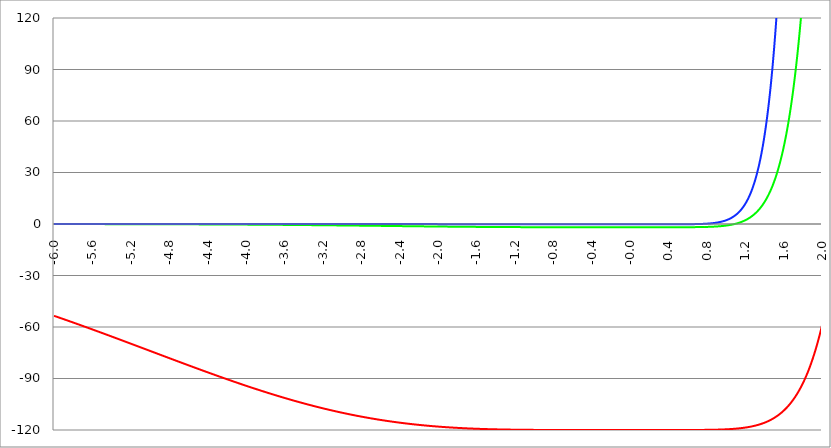
| Category | Series 1 | Series 0 | Series 2 |
|---|---|---|---|
| -6.0 | -53.482 | -0.038 | 0 |
| -5.996 | -53.559 | -0.038 | 0 |
| -5.992000000000001 | -53.636 | -0.039 | 0 |
| -5.988000000000001 | -53.713 | -0.039 | 0 |
| -5.984000000000002 | -53.79 | -0.039 | 0 |
| -5.980000000000002 | -53.868 | -0.039 | 0 |
| -5.976000000000002 | -53.945 | -0.039 | 0 |
| -5.972000000000003 | -54.023 | -0.039 | 0 |
| -5.968000000000003 | -54.1 | -0.04 | 0 |
| -5.964000000000004 | -54.178 | -0.04 | 0 |
| -5.960000000000004 | -54.255 | -0.04 | 0 |
| -5.956000000000004 | -54.333 | -0.04 | 0 |
| -5.952000000000005 | -54.41 | -0.04 | 0 |
| -5.948000000000005 | -54.488 | -0.041 | 0 |
| -5.944000000000006 | -54.566 | -0.041 | 0 |
| -5.940000000000006 | -54.644 | -0.041 | 0 |
| -5.936000000000007 | -54.722 | -0.041 | 0 |
| -5.932000000000007 | -54.8 | -0.042 | 0 |
| -5.928000000000008 | -54.878 | -0.042 | 0 |
| -5.924000000000008 | -54.956 | -0.042 | 0 |
| -5.920000000000009 | -55.034 | -0.042 | 0 |
| -5.91600000000001 | -55.112 | -0.042 | 0 |
| -5.91200000000001 | -55.19 | -0.043 | 0 |
| -5.90800000000001 | -55.268 | -0.043 | 0 |
| -5.904000000000011 | -55.346 | -0.043 | 0 |
| -5.900000000000011 | -55.425 | -0.043 | 0 |
| -5.896000000000011 | -55.503 | -0.043 | 0 |
| -5.892000000000012 | -55.582 | -0.044 | 0 |
| -5.888000000000012 | -55.66 | -0.044 | 0 |
| -5.884000000000013 | -55.738 | -0.044 | 0 |
| -5.880000000000013 | -55.817 | -0.044 | 0 |
| -5.876000000000014 | -55.896 | -0.045 | 0 |
| -5.872000000000014 | -55.974 | -0.045 | 0 |
| -5.868000000000014 | -56.053 | -0.045 | 0 |
| -5.864000000000015 | -56.132 | -0.045 | 0 |
| -5.860000000000015 | -56.21 | -0.045 | 0 |
| -5.856000000000016 | -56.289 | -0.046 | 0 |
| -5.852000000000016 | -56.368 | -0.046 | 0 |
| -5.848000000000017 | -56.447 | -0.046 | 0 |
| -5.844000000000017 | -56.526 | -0.046 | 0 |
| -5.840000000000018 | -56.605 | -0.047 | 0 |
| -5.836000000000018 | -56.684 | -0.047 | 0 |
| -5.832000000000018 | -56.763 | -0.047 | 0 |
| -5.828000000000019 | -56.842 | -0.047 | 0 |
| -5.824000000000019 | -56.922 | -0.047 | 0 |
| -5.82000000000002 | -57.001 | -0.048 | 0 |
| -5.81600000000002 | -57.08 | -0.048 | 0 |
| -5.812000000000021 | -57.16 | -0.048 | 0 |
| -5.808000000000021 | -57.239 | -0.048 | 0 |
| -5.804000000000022 | -57.318 | -0.049 | 0 |
| -5.800000000000022 | -57.398 | -0.049 | 0 |
| -5.796000000000022 | -57.477 | -0.049 | 0 |
| -5.792000000000023 | -57.557 | -0.049 | 0 |
| -5.788000000000023 | -57.636 | -0.05 | 0 |
| -5.784000000000024 | -57.716 | -0.05 | 0 |
| -5.780000000000024 | -57.796 | -0.05 | 0 |
| -5.776000000000024 | -57.875 | -0.05 | 0 |
| -5.772000000000025 | -57.955 | -0.051 | 0 |
| -5.768000000000025 | -58.035 | -0.051 | 0 |
| -5.764000000000026 | -58.115 | -0.051 | 0 |
| -5.760000000000026 | -58.195 | -0.051 | 0 |
| -5.756000000000026 | -58.275 | -0.052 | 0 |
| -5.752000000000027 | -58.355 | -0.052 | 0 |
| -5.748000000000027 | -58.435 | -0.052 | 0 |
| -5.744000000000028 | -58.515 | -0.052 | 0 |
| -5.740000000000028 | -58.595 | -0.053 | 0 |
| -5.73600000000003 | -58.675 | -0.053 | 0 |
| -5.73200000000003 | -58.755 | -0.053 | 0 |
| -5.72800000000003 | -58.835 | -0.053 | 0 |
| -5.72400000000003 | -58.916 | -0.054 | 0 |
| -5.720000000000031 | -58.996 | -0.054 | 0 |
| -5.716000000000031 | -59.076 | -0.054 | 0 |
| -5.712000000000032 | -59.157 | -0.054 | 0 |
| -5.708000000000032 | -59.237 | -0.055 | 0 |
| -5.704000000000033 | -59.318 | -0.055 | 0 |
| -5.700000000000033 | -59.398 | -0.055 | 0 |
| -5.696000000000033 | -59.479 | -0.056 | 0 |
| -5.692000000000034 | -59.559 | -0.056 | 0 |
| -5.688000000000034 | -59.64 | -0.056 | 0 |
| -5.684000000000035 | -59.721 | -0.056 | 0 |
| -5.680000000000035 | -59.801 | -0.057 | 0 |
| -5.676000000000035 | -59.882 | -0.057 | 0 |
| -5.672000000000036 | -59.963 | -0.057 | 0 |
| -5.668000000000036 | -60.044 | -0.057 | 0 |
| -5.664000000000037 | -60.125 | -0.058 | 0 |
| -5.660000000000037 | -60.205 | -0.058 | 0 |
| -5.656000000000038 | -60.286 | -0.058 | 0 |
| -5.652000000000038 | -60.367 | -0.059 | 0 |
| -5.648000000000039 | -60.448 | -0.059 | 0 |
| -5.644000000000039 | -60.529 | -0.059 | 0 |
| -5.64000000000004 | -60.61 | -0.059 | 0 |
| -5.63600000000004 | -60.692 | -0.06 | 0 |
| -5.63200000000004 | -60.773 | -0.06 | 0 |
| -5.628000000000041 | -60.854 | -0.06 | 0 |
| -5.624000000000041 | -60.935 | -0.061 | 0 |
| -5.620000000000042 | -61.016 | -0.061 | 0 |
| -5.616000000000042 | -61.098 | -0.061 | 0 |
| -5.612000000000043 | -61.179 | -0.061 | 0 |
| -5.608000000000043 | -61.26 | -0.062 | 0 |
| -5.604000000000044 | -61.342 | -0.062 | 0 |
| -5.600000000000044 | -61.423 | -0.062 | 0 |
| -5.596000000000044 | -61.505 | -0.063 | 0 |
| -5.592000000000045 | -61.586 | -0.063 | 0 |
| -5.588000000000045 | -61.668 | -0.063 | 0 |
| -5.584000000000046 | -61.749 | -0.064 | 0 |
| -5.580000000000046 | -61.831 | -0.064 | 0 |
| -5.576000000000046 | -61.913 | -0.064 | 0 |
| -5.572000000000047 | -61.994 | -0.065 | 0 |
| -5.568000000000048 | -62.076 | -0.065 | 0 |
| -5.564000000000048 | -62.158 | -0.065 | 0 |
| -5.560000000000048 | -62.24 | -0.065 | 0 |
| -5.556000000000049 | -62.321 | -0.066 | 0 |
| -5.552000000000049 | -62.403 | -0.066 | 0 |
| -5.54800000000005 | -62.485 | -0.066 | 0 |
| -5.54400000000005 | -62.567 | -0.067 | 0 |
| -5.540000000000051 | -62.649 | -0.067 | 0 |
| -5.536000000000051 | -62.731 | -0.067 | 0 |
| -5.532000000000052 | -62.813 | -0.068 | 0 |
| -5.528000000000052 | -62.895 | -0.068 | 0 |
| -5.524000000000052 | -62.977 | -0.068 | 0 |
| -5.520000000000053 | -63.059 | -0.069 | 0 |
| -5.516000000000053 | -63.141 | -0.069 | 0 |
| -5.512000000000054 | -63.224 | -0.069 | 0 |
| -5.508000000000054 | -63.306 | -0.07 | 0 |
| -5.504000000000055 | -63.388 | -0.07 | 0 |
| -5.500000000000055 | -63.47 | -0.07 | 0 |
| -5.496000000000055 | -63.553 | -0.071 | 0 |
| -5.492000000000056 | -63.635 | -0.071 | 0 |
| -5.488000000000056 | -63.717 | -0.071 | 0 |
| -5.484000000000057 | -63.8 | -0.072 | 0 |
| -5.480000000000057 | -63.882 | -0.072 | 0 |
| -5.476000000000057 | -63.964 | -0.072 | 0 |
| -5.472000000000058 | -64.047 | -0.073 | 0 |
| -5.468000000000059 | -64.129 | -0.073 | 0 |
| -5.464000000000059 | -64.212 | -0.073 | 0 |
| -5.460000000000059 | -64.294 | -0.074 | 0 |
| -5.45600000000006 | -64.377 | -0.074 | 0 |
| -5.45200000000006 | -64.46 | -0.074 | 0 |
| -5.44800000000006 | -64.542 | -0.075 | 0 |
| -5.444000000000061 | -64.625 | -0.075 | 0 |
| -5.440000000000061 | -64.708 | -0.076 | 0 |
| -5.436000000000062 | -64.79 | -0.076 | 0 |
| -5.432000000000062 | -64.873 | -0.076 | 0 |
| -5.428000000000063 | -64.956 | -0.077 | 0 |
| -5.424000000000063 | -65.039 | -0.077 | 0 |
| -5.420000000000064 | -65.121 | -0.077 | 0 |
| -5.416000000000064 | -65.204 | -0.078 | 0 |
| -5.412000000000064 | -65.287 | -0.078 | 0 |
| -5.408000000000065 | -65.37 | -0.078 | 0 |
| -5.404000000000065 | -65.453 | -0.079 | 0 |
| -5.400000000000066 | -65.536 | -0.079 | 0 |
| -5.396000000000066 | -65.619 | -0.08 | 0 |
| -5.392000000000067 | -65.702 | -0.08 | 0 |
| -5.388000000000067 | -65.785 | -0.08 | 0 |
| -5.384000000000068 | -65.868 | -0.081 | 0 |
| -5.380000000000068 | -65.951 | -0.081 | 0 |
| -5.376000000000068 | -66.034 | -0.082 | 0 |
| -5.37200000000007 | -66.117 | -0.082 | 0 |
| -5.36800000000007 | -66.2 | -0.082 | 0 |
| -5.36400000000007 | -66.283 | -0.083 | 0 |
| -5.36000000000007 | -66.367 | -0.083 | 0 |
| -5.356000000000071 | -66.45 | -0.083 | 0 |
| -5.352000000000071 | -66.533 | -0.084 | 0 |
| -5.348000000000072 | -66.616 | -0.084 | 0 |
| -5.344000000000072 | -66.7 | -0.085 | 0 |
| -5.340000000000073 | -66.783 | -0.085 | 0 |
| -5.336000000000073 | -66.866 | -0.085 | 0 |
| -5.332000000000074 | -66.949 | -0.086 | 0 |
| -5.328000000000074 | -67.033 | -0.086 | 0 |
| -5.324000000000074 | -67.116 | -0.087 | 0 |
| -5.320000000000075 | -67.2 | -0.087 | 0 |
| -5.316000000000075 | -67.283 | -0.087 | 0 |
| -5.312000000000076 | -67.366 | -0.088 | 0 |
| -5.308000000000076 | -67.45 | -0.088 | 0 |
| -5.304000000000077 | -67.533 | -0.089 | 0 |
| -5.300000000000077 | -67.617 | -0.089 | 0 |
| -5.296000000000077 | -67.7 | -0.09 | 0 |
| -5.292000000000078 | -67.784 | -0.09 | 0 |
| -5.288000000000078 | -67.867 | -0.09 | 0 |
| -5.284000000000079 | -67.951 | -0.091 | 0 |
| -5.28000000000008 | -68.035 | -0.091 | 0 |
| -5.27600000000008 | -68.118 | -0.092 | 0 |
| -5.27200000000008 | -68.202 | -0.092 | 0 |
| -5.268000000000081 | -68.285 | -0.093 | 0 |
| -5.264000000000081 | -68.369 | -0.093 | 0 |
| -5.260000000000081 | -68.453 | -0.093 | 0 |
| -5.256000000000082 | -68.536 | -0.094 | 0 |
| -5.252000000000082 | -68.62 | -0.094 | 0 |
| -5.248000000000083 | -68.704 | -0.095 | 0 |
| -5.244000000000083 | -68.788 | -0.095 | 0 |
| -5.240000000000084 | -68.871 | -0.096 | 0 |
| -5.236000000000084 | -68.955 | -0.096 | 0 |
| -5.232000000000084 | -69.039 | -0.096 | 0 |
| -5.228000000000085 | -69.123 | -0.097 | 0 |
| -5.224000000000085 | -69.206 | -0.097 | 0 |
| -5.220000000000086 | -69.29 | -0.098 | 0 |
| -5.216000000000086 | -69.374 | -0.098 | 0 |
| -5.212000000000087 | -69.458 | -0.099 | 0 |
| -5.208000000000087 | -69.542 | -0.099 | 0 |
| -5.204000000000088 | -69.626 | -0.1 | 0 |
| -5.200000000000088 | -69.71 | -0.1 | 0 |
| -5.196000000000089 | -69.793 | -0.101 | 0 |
| -5.192000000000089 | -69.877 | -0.101 | 0 |
| -5.188000000000089 | -69.961 | -0.101 | 0 |
| -5.18400000000009 | -70.045 | -0.102 | 0 |
| -5.18000000000009 | -70.129 | -0.102 | 0 |
| -5.176000000000091 | -70.213 | -0.103 | 0 |
| -5.172000000000091 | -70.297 | -0.103 | 0 |
| -5.168000000000092 | -70.381 | -0.104 | 0 |
| -5.164000000000092 | -70.465 | -0.104 | 0 |
| -5.160000000000092 | -70.549 | -0.105 | 0 |
| -5.156000000000093 | -70.633 | -0.105 | 0 |
| -5.152000000000093 | -70.717 | -0.106 | 0 |
| -5.148000000000094 | -70.801 | -0.106 | 0 |
| -5.144000000000094 | -70.885 | -0.107 | 0 |
| -5.140000000000095 | -70.969 | -0.107 | 0 |
| -5.136000000000095 | -71.053 | -0.108 | 0 |
| -5.132000000000096 | -71.137 | -0.108 | 0 |
| -5.128000000000096 | -71.222 | -0.109 | 0 |
| -5.124000000000096 | -71.306 | -0.109 | 0 |
| -5.120000000000097 | -71.39 | -0.11 | 0 |
| -5.116000000000097 | -71.474 | -0.11 | 0 |
| -5.112000000000098 | -71.558 | -0.111 | 0 |
| -5.108000000000098 | -71.642 | -0.111 | 0 |
| -5.104000000000099 | -71.726 | -0.112 | 0 |
| -5.100000000000099 | -71.81 | -0.112 | 0 |
| -5.0960000000001 | -71.895 | -0.113 | 0 |
| -5.0920000000001 | -71.979 | -0.113 | 0 |
| -5.0880000000001 | -72.063 | -0.114 | 0 |
| -5.084000000000101 | -72.147 | -0.114 | 0 |
| -5.080000000000101 | -72.231 | -0.115 | 0 |
| -5.076000000000101 | -72.315 | -0.115 | 0 |
| -5.072000000000102 | -72.4 | -0.116 | 0 |
| -5.068000000000103 | -72.484 | -0.116 | 0 |
| -5.064000000000103 | -72.568 | -0.117 | 0 |
| -5.060000000000104 | -72.652 | -0.118 | 0 |
| -5.056000000000104 | -72.736 | -0.118 | 0 |
| -5.052000000000104 | -72.82 | -0.119 | 0 |
| -5.048000000000104 | -72.905 | -0.119 | 0 |
| -5.044000000000105 | -72.989 | -0.12 | 0 |
| -5.040000000000105 | -73.073 | -0.12 | 0 |
| -5.036000000000106 | -73.157 | -0.121 | 0 |
| -5.032000000000106 | -73.242 | -0.121 | 0 |
| -5.028000000000107 | -73.326 | -0.122 | 0 |
| -5.024000000000107 | -73.41 | -0.122 | 0 |
| -5.020000000000108 | -73.494 | -0.123 | 0 |
| -5.016000000000108 | -73.578 | -0.124 | 0 |
| -5.012000000000109 | -73.663 | -0.124 | 0 |
| -5.00800000000011 | -73.747 | -0.125 | 0 |
| -5.00400000000011 | -73.831 | -0.125 | 0 |
| -5.00000000000011 | -73.915 | -0.126 | 0 |
| -4.99600000000011 | -74 | -0.126 | 0 |
| -4.992000000000111 | -74.084 | -0.127 | 0 |
| -4.988000000000111 | -74.168 | -0.127 | 0 |
| -4.984000000000112 | -74.252 | -0.128 | 0 |
| -4.980000000000112 | -74.336 | -0.129 | 0 |
| -4.976000000000112 | -74.421 | -0.129 | 0 |
| -4.972000000000113 | -74.505 | -0.13 | 0 |
| -4.968000000000114 | -74.589 | -0.13 | 0 |
| -4.964000000000114 | -74.673 | -0.131 | 0 |
| -4.960000000000114 | -74.757 | -0.132 | 0 |
| -4.956000000000114 | -74.842 | -0.132 | -0.001 |
| -4.952000000000115 | -74.926 | -0.133 | -0.001 |
| -4.948000000000115 | -75.01 | -0.133 | -0.001 |
| -4.944000000000116 | -75.094 | -0.134 | -0.001 |
| -4.940000000000116 | -75.178 | -0.135 | -0.001 |
| -4.936000000000117 | -75.263 | -0.135 | -0.001 |
| -4.932000000000117 | -75.347 | -0.136 | -0.001 |
| -4.928000000000118 | -75.431 | -0.136 | -0.001 |
| -4.924000000000118 | -75.515 | -0.137 | -0.001 |
| -4.920000000000119 | -75.599 | -0.138 | -0.001 |
| -4.91600000000012 | -75.684 | -0.138 | -0.001 |
| -4.91200000000012 | -75.768 | -0.139 | -0.001 |
| -4.90800000000012 | -75.852 | -0.139 | -0.001 |
| -4.90400000000012 | -75.936 | -0.14 | -0.001 |
| -4.90000000000012 | -76.02 | -0.141 | -0.001 |
| -4.896000000000121 | -76.104 | -0.141 | -0.001 |
| -4.892000000000122 | -76.188 | -0.142 | -0.001 |
| -4.888000000000122 | -76.273 | -0.143 | -0.001 |
| -4.884000000000123 | -76.357 | -0.143 | -0.001 |
| -4.880000000000123 | -76.441 | -0.144 | -0.001 |
| -4.876000000000123 | -76.525 | -0.145 | -0.001 |
| -4.872000000000124 | -76.609 | -0.145 | -0.001 |
| -4.868000000000124 | -76.693 | -0.146 | -0.001 |
| -4.864000000000125 | -76.777 | -0.146 | -0.001 |
| -4.860000000000125 | -76.861 | -0.147 | -0.001 |
| -4.856000000000125 | -76.945 | -0.148 | -0.001 |
| -4.852000000000126 | -77.029 | -0.148 | -0.001 |
| -4.848000000000126 | -77.113 | -0.149 | -0.001 |
| -4.844000000000127 | -77.197 | -0.15 | -0.001 |
| -4.840000000000127 | -77.281 | -0.15 | -0.001 |
| -4.836000000000128 | -77.365 | -0.151 | -0.001 |
| -4.832000000000128 | -77.449 | -0.152 | -0.001 |
| -4.82800000000013 | -77.533 | -0.152 | -0.001 |
| -4.824000000000129 | -77.617 | -0.153 | -0.001 |
| -4.82000000000013 | -77.701 | -0.154 | -0.001 |
| -4.81600000000013 | -77.785 | -0.154 | -0.001 |
| -4.812000000000131 | -77.869 | -0.155 | -0.001 |
| -4.808000000000131 | -77.953 | -0.156 | -0.001 |
| -4.804000000000132 | -78.037 | -0.156 | -0.001 |
| -4.800000000000132 | -78.121 | -0.157 | -0.001 |
| -4.796000000000132 | -78.205 | -0.158 | -0.001 |
| -4.792000000000133 | -78.289 | -0.159 | -0.001 |
| -4.788000000000133 | -78.372 | -0.159 | -0.001 |
| -4.784000000000134 | -78.456 | -0.16 | -0.001 |
| -4.780000000000134 | -78.54 | -0.161 | -0.001 |
| -4.776000000000134 | -78.624 | -0.161 | -0.001 |
| -4.772000000000135 | -78.708 | -0.162 | -0.001 |
| -4.768000000000135 | -78.791 | -0.163 | -0.001 |
| -4.764000000000136 | -78.875 | -0.163 | -0.001 |
| -4.760000000000136 | -78.959 | -0.164 | -0.001 |
| -4.756000000000136 | -79.043 | -0.165 | -0.001 |
| -4.752000000000137 | -79.126 | -0.166 | -0.001 |
| -4.748000000000137 | -79.21 | -0.166 | -0.001 |
| -4.744000000000138 | -79.294 | -0.167 | -0.001 |
| -4.740000000000138 | -79.377 | -0.168 | -0.001 |
| -4.73600000000014 | -79.461 | -0.169 | -0.001 |
| -4.73200000000014 | -79.544 | -0.169 | -0.001 |
| -4.72800000000014 | -79.628 | -0.17 | -0.001 |
| -4.72400000000014 | -79.712 | -0.171 | -0.001 |
| -4.720000000000141 | -79.795 | -0.171 | -0.001 |
| -4.716000000000141 | -79.879 | -0.172 | -0.001 |
| -4.712000000000142 | -79.962 | -0.173 | -0.001 |
| -4.708000000000142 | -80.046 | -0.174 | -0.001 |
| -4.704000000000143 | -80.129 | -0.175 | -0.001 |
| -4.700000000000143 | -80.213 | -0.175 | -0.001 |
| -4.696000000000143 | -80.296 | -0.176 | -0.001 |
| -4.692000000000144 | -80.379 | -0.177 | -0.001 |
| -4.688000000000144 | -80.463 | -0.178 | -0.001 |
| -4.684000000000145 | -80.546 | -0.178 | -0.001 |
| -4.680000000000145 | -80.63 | -0.179 | -0.001 |
| -4.676000000000145 | -80.713 | -0.18 | -0.001 |
| -4.672000000000146 | -80.796 | -0.181 | -0.001 |
| -4.668000000000147 | -80.879 | -0.181 | -0.001 |
| -4.664000000000147 | -80.963 | -0.182 | -0.001 |
| -4.660000000000147 | -81.046 | -0.183 | -0.001 |
| -4.656000000000148 | -81.129 | -0.184 | -0.001 |
| -4.652000000000148 | -81.212 | -0.185 | -0.001 |
| -4.648000000000149 | -81.295 | -0.185 | -0.001 |
| -4.644000000000149 | -81.379 | -0.186 | -0.001 |
| -4.64000000000015 | -81.462 | -0.187 | -0.001 |
| -4.63600000000015 | -81.545 | -0.188 | -0.001 |
| -4.632000000000151 | -81.628 | -0.189 | -0.001 |
| -4.628000000000151 | -81.711 | -0.189 | -0.001 |
| -4.624000000000151 | -81.794 | -0.19 | -0.001 |
| -4.620000000000152 | -81.877 | -0.191 | -0.001 |
| -4.616000000000152 | -81.96 | -0.192 | -0.001 |
| -4.612000000000153 | -82.043 | -0.193 | -0.001 |
| -4.608000000000153 | -82.125 | -0.193 | -0.001 |
| -4.604000000000154 | -82.208 | -0.194 | -0.001 |
| -4.600000000000154 | -82.291 | -0.195 | -0.001 |
| -4.596000000000154 | -82.374 | -0.196 | -0.001 |
| -4.592000000000155 | -82.457 | -0.197 | -0.001 |
| -4.588000000000155 | -82.539 | -0.198 | -0.001 |
| -4.584000000000156 | -82.622 | -0.198 | -0.001 |
| -4.580000000000156 | -82.705 | -0.199 | -0.001 |
| -4.576000000000156 | -82.787 | -0.2 | -0.001 |
| -4.572000000000157 | -82.87 | -0.201 | -0.001 |
| -4.568000000000158 | -82.953 | -0.202 | -0.001 |
| -4.564000000000158 | -83.035 | -0.203 | -0.001 |
| -4.560000000000159 | -83.118 | -0.204 | -0.001 |
| -4.55600000000016 | -83.2 | -0.204 | -0.001 |
| -4.552000000000159 | -83.283 | -0.205 | -0.001 |
| -4.54800000000016 | -83.365 | -0.206 | -0.001 |
| -4.54400000000016 | -83.448 | -0.207 | -0.001 |
| -4.54000000000016 | -83.53 | -0.208 | -0.001 |
| -4.53600000000016 | -83.612 | -0.209 | -0.001 |
| -4.532000000000161 | -83.695 | -0.21 | -0.001 |
| -4.528000000000162 | -83.777 | -0.211 | -0.001 |
| -4.524000000000163 | -83.859 | -0.212 | -0.001 |
| -4.520000000000163 | -83.941 | -0.212 | -0.001 |
| -4.516000000000163 | -84.023 | -0.213 | -0.001 |
| -4.512000000000164 | -84.105 | -0.214 | -0.001 |
| -4.508000000000164 | -84.188 | -0.215 | -0.001 |
| -4.504000000000164 | -84.27 | -0.216 | -0.001 |
| -4.500000000000165 | -84.352 | -0.217 | -0.001 |
| -4.496000000000165 | -84.434 | -0.218 | -0.001 |
| -4.492000000000166 | -84.516 | -0.219 | -0.001 |
| -4.488000000000166 | -84.597 | -0.22 | -0.001 |
| -4.484000000000166 | -84.679 | -0.221 | -0.001 |
| -4.480000000000167 | -84.761 | -0.222 | -0.001 |
| -4.476000000000167 | -84.843 | -0.222 | -0.001 |
| -4.472000000000168 | -84.925 | -0.223 | -0.001 |
| -4.468000000000168 | -85.006 | -0.224 | -0.001 |
| -4.46400000000017 | -85.088 | -0.225 | -0.001 |
| -4.46000000000017 | -85.17 | -0.226 | -0.001 |
| -4.45600000000017 | -85.251 | -0.227 | -0.001 |
| -4.45200000000017 | -85.333 | -0.228 | -0.001 |
| -4.44800000000017 | -85.414 | -0.229 | -0.001 |
| -4.444000000000171 | -85.496 | -0.23 | -0.001 |
| -4.440000000000171 | -85.577 | -0.231 | -0.001 |
| -4.436000000000172 | -85.659 | -0.232 | -0.001 |
| -4.432000000000172 | -85.74 | -0.233 | -0.001 |
| -4.428000000000173 | -85.821 | -0.234 | -0.001 |
| -4.424000000000174 | -85.903 | -0.235 | -0.001 |
| -4.420000000000174 | -85.984 | -0.236 | -0.001 |
| -4.416000000000174 | -86.065 | -0.237 | -0.002 |
| -4.412000000000174 | -86.146 | -0.238 | -0.002 |
| -4.408000000000175 | -86.227 | -0.239 | -0.002 |
| -4.404000000000175 | -86.308 | -0.24 | -0.002 |
| -4.400000000000176 | -86.389 | -0.241 | -0.002 |
| -4.396000000000176 | -86.47 | -0.242 | -0.002 |
| -4.392000000000177 | -86.551 | -0.243 | -0.002 |
| -4.388000000000177 | -86.632 | -0.244 | -0.002 |
| -4.384000000000178 | -86.713 | -0.245 | -0.002 |
| -4.380000000000178 | -86.794 | -0.246 | -0.002 |
| -4.376000000000178 | -86.875 | -0.247 | -0.002 |
| -4.37200000000018 | -86.955 | -0.248 | -0.002 |
| -4.36800000000018 | -87.036 | -0.249 | -0.002 |
| -4.36400000000018 | -87.116 | -0.25 | -0.002 |
| -4.360000000000181 | -87.197 | -0.251 | -0.002 |
| -4.356000000000181 | -87.278 | -0.252 | -0.002 |
| -4.352000000000181 | -87.358 | -0.253 | -0.002 |
| -4.348000000000182 | -87.438 | -0.254 | -0.002 |
| -4.344000000000182 | -87.519 | -0.255 | -0.002 |
| -4.340000000000183 | -87.599 | -0.256 | -0.002 |
| -4.336000000000183 | -87.679 | -0.257 | -0.002 |
| -4.332000000000184 | -87.76 | -0.258 | -0.002 |
| -4.328000000000184 | -87.84 | -0.259 | -0.002 |
| -4.324000000000185 | -87.92 | -0.26 | -0.002 |
| -4.320000000000185 | -88 | -0.261 | -0.002 |
| -4.316000000000185 | -88.08 | -0.262 | -0.002 |
| -4.312000000000186 | -88.16 | -0.263 | -0.002 |
| -4.308000000000186 | -88.24 | -0.265 | -0.002 |
| -4.304000000000187 | -88.32 | -0.266 | -0.002 |
| -4.300000000000187 | -88.4 | -0.267 | -0.002 |
| -4.296000000000187 | -88.479 | -0.268 | -0.002 |
| -4.292000000000188 | -88.559 | -0.269 | -0.002 |
| -4.288000000000188 | -88.639 | -0.27 | -0.002 |
| -4.284000000000189 | -88.718 | -0.271 | -0.002 |
| -4.28000000000019 | -88.798 | -0.272 | -0.002 |
| -4.27600000000019 | -88.877 | -0.273 | -0.002 |
| -4.27200000000019 | -88.957 | -0.274 | -0.002 |
| -4.268000000000191 | -89.036 | -0.275 | -0.002 |
| -4.264000000000191 | -89.115 | -0.277 | -0.002 |
| -4.260000000000192 | -89.195 | -0.278 | -0.002 |
| -4.256000000000192 | -89.274 | -0.279 | -0.002 |
| -4.252000000000192 | -89.353 | -0.28 | -0.002 |
| -4.248000000000193 | -89.432 | -0.281 | -0.002 |
| -4.244000000000193 | -89.511 | -0.282 | -0.002 |
| -4.240000000000194 | -89.59 | -0.283 | -0.002 |
| -4.236000000000194 | -89.669 | -0.284 | -0.002 |
| -4.232000000000194 | -89.748 | -0.286 | -0.002 |
| -4.228000000000195 | -89.827 | -0.287 | -0.002 |
| -4.224000000000196 | -89.906 | -0.288 | -0.002 |
| -4.220000000000196 | -89.984 | -0.289 | -0.002 |
| -4.216000000000196 | -90.063 | -0.29 | -0.002 |
| -4.212000000000197 | -90.142 | -0.291 | -0.002 |
| -4.208000000000197 | -90.22 | -0.293 | -0.002 |
| -4.204000000000198 | -90.299 | -0.294 | -0.002 |
| -4.200000000000198 | -90.377 | -0.295 | -0.002 |
| -4.196000000000199 | -90.456 | -0.296 | -0.002 |
| -4.192000000000199 | -90.534 | -0.297 | -0.002 |
| -4.1880000000002 | -90.612 | -0.298 | -0.002 |
| -4.1840000000002 | -90.69 | -0.3 | -0.002 |
| -4.1800000000002 | -90.768 | -0.301 | -0.002 |
| -4.176000000000201 | -90.846 | -0.302 | -0.002 |
| -4.172000000000201 | -90.924 | -0.303 | -0.002 |
| -4.168000000000202 | -91.002 | -0.304 | -0.002 |
| -4.164000000000202 | -91.08 | -0.306 | -0.002 |
| -4.160000000000203 | -91.158 | -0.307 | -0.002 |
| -4.156000000000203 | -91.236 | -0.308 | -0.002 |
| -4.152000000000204 | -91.313 | -0.309 | -0.003 |
| -4.148000000000204 | -91.391 | -0.311 | -0.003 |
| -4.144000000000204 | -91.469 | -0.312 | -0.003 |
| -4.140000000000205 | -91.546 | -0.313 | -0.003 |
| -4.136000000000205 | -91.624 | -0.314 | -0.003 |
| -4.132000000000206 | -91.701 | -0.315 | -0.003 |
| -4.128000000000206 | -91.778 | -0.317 | -0.003 |
| -4.124000000000207 | -91.855 | -0.318 | -0.003 |
| -4.120000000000207 | -91.933 | -0.319 | -0.003 |
| -4.116000000000207 | -92.01 | -0.32 | -0.003 |
| -4.112000000000208 | -92.087 | -0.322 | -0.003 |
| -4.108000000000208 | -92.164 | -0.323 | -0.003 |
| -4.104000000000209 | -92.241 | -0.324 | -0.003 |
| -4.100000000000209 | -92.317 | -0.325 | -0.003 |
| -4.09600000000021 | -92.394 | -0.327 | -0.003 |
| -4.09200000000021 | -92.471 | -0.328 | -0.003 |
| -4.088000000000211 | -92.548 | -0.329 | -0.003 |
| -4.084000000000211 | -92.624 | -0.331 | -0.003 |
| -4.080000000000211 | -92.701 | -0.332 | -0.003 |
| -4.076000000000212 | -92.777 | -0.333 | -0.003 |
| -4.072000000000212 | -92.853 | -0.334 | -0.003 |
| -4.068000000000213 | -92.93 | -0.336 | -0.003 |
| -4.064000000000213 | -93.006 | -0.337 | -0.003 |
| -4.060000000000214 | -93.082 | -0.338 | -0.003 |
| -4.056000000000214 | -93.158 | -0.34 | -0.003 |
| -4.052000000000215 | -93.234 | -0.341 | -0.003 |
| -4.048000000000215 | -93.31 | -0.342 | -0.003 |
| -4.044000000000215 | -93.386 | -0.344 | -0.003 |
| -4.040000000000216 | -93.462 | -0.345 | -0.003 |
| -4.036000000000216 | -93.537 | -0.346 | -0.003 |
| -4.032000000000217 | -93.613 | -0.348 | -0.003 |
| -4.028000000000217 | -93.689 | -0.349 | -0.003 |
| -4.024000000000218 | -93.764 | -0.35 | -0.003 |
| -4.020000000000218 | -93.84 | -0.352 | -0.003 |
| -4.016000000000219 | -93.915 | -0.353 | -0.003 |
| -4.012000000000219 | -93.99 | -0.354 | -0.003 |
| -4.008000000000219 | -94.065 | -0.356 | -0.003 |
| -4.00400000000022 | -94.141 | -0.357 | -0.003 |
| -4.00000000000022 | -94.216 | -0.359 | -0.003 |
| -3.99600000000022 | -94.291 | -0.36 | -0.003 |
| -3.99200000000022 | -94.366 | -0.361 | -0.003 |
| -3.98800000000022 | -94.44 | -0.363 | -0.003 |
| -3.98400000000022 | -94.515 | -0.364 | -0.003 |
| -3.98000000000022 | -94.59 | -0.365 | -0.003 |
| -3.97600000000022 | -94.664 | -0.367 | -0.004 |
| -3.97200000000022 | -94.739 | -0.368 | -0.004 |
| -3.96800000000022 | -94.813 | -0.37 | -0.004 |
| -3.96400000000022 | -94.888 | -0.371 | -0.004 |
| -3.96000000000022 | -94.962 | -0.373 | -0.004 |
| -3.95600000000022 | -95.036 | -0.374 | -0.004 |
| -3.95200000000022 | -95.11 | -0.375 | -0.004 |
| -3.94800000000022 | -95.184 | -0.377 | -0.004 |
| -3.94400000000022 | -95.258 | -0.378 | -0.004 |
| -3.94000000000022 | -95.332 | -0.38 | -0.004 |
| -3.93600000000022 | -95.406 | -0.381 | -0.004 |
| -3.93200000000022 | -95.48 | -0.383 | -0.004 |
| -3.92800000000022 | -95.554 | -0.384 | -0.004 |
| -3.92400000000022 | -95.627 | -0.385 | -0.004 |
| -3.92000000000022 | -95.701 | -0.387 | -0.004 |
| -3.91600000000022 | -95.774 | -0.388 | -0.004 |
| -3.91200000000022 | -95.847 | -0.39 | -0.004 |
| -3.90800000000022 | -95.921 | -0.391 | -0.004 |
| -3.90400000000022 | -95.994 | -0.393 | -0.004 |
| -3.90000000000022 | -96.067 | -0.394 | -0.004 |
| -3.89600000000022 | -96.14 | -0.396 | -0.004 |
| -3.89200000000022 | -96.213 | -0.397 | -0.004 |
| -3.88800000000022 | -96.286 | -0.399 | -0.004 |
| -3.88400000000022 | -96.358 | -0.4 | -0.004 |
| -3.88000000000022 | -96.431 | -0.402 | -0.004 |
| -3.87600000000022 | -96.504 | -0.403 | -0.004 |
| -3.87200000000022 | -96.576 | -0.405 | -0.004 |
| -3.86800000000022 | -96.649 | -0.406 | -0.004 |
| -3.86400000000022 | -96.721 | -0.408 | -0.004 |
| -3.86000000000022 | -96.793 | -0.409 | -0.004 |
| -3.85600000000022 | -96.865 | -0.411 | -0.004 |
| -3.85200000000022 | -96.938 | -0.412 | -0.004 |
| -3.84800000000022 | -97.01 | -0.414 | -0.004 |
| -3.84400000000022 | -97.081 | -0.415 | -0.004 |
| -3.84000000000022 | -97.153 | -0.417 | -0.005 |
| -3.83600000000022 | -97.225 | -0.418 | -0.005 |
| -3.83200000000022 | -97.297 | -0.42 | -0.005 |
| -3.82800000000022 | -97.368 | -0.422 | -0.005 |
| -3.82400000000022 | -97.44 | -0.423 | -0.005 |
| -3.82000000000022 | -97.511 | -0.425 | -0.005 |
| -3.81600000000022 | -97.582 | -0.426 | -0.005 |
| -3.81200000000022 | -97.654 | -0.428 | -0.005 |
| -3.80800000000022 | -97.725 | -0.429 | -0.005 |
| -3.80400000000022 | -97.796 | -0.431 | -0.005 |
| -3.80000000000022 | -97.867 | -0.433 | -0.005 |
| -3.79600000000022 | -97.938 | -0.434 | -0.005 |
| -3.79200000000022 | -98.008 | -0.436 | -0.005 |
| -3.78800000000022 | -98.079 | -0.437 | -0.005 |
| -3.78400000000022 | -98.15 | -0.439 | -0.005 |
| -3.78000000000022 | -98.22 | -0.441 | -0.005 |
| -3.77600000000022 | -98.291 | -0.442 | -0.005 |
| -3.77200000000022 | -98.361 | -0.444 | -0.005 |
| -3.76800000000022 | -98.431 | -0.445 | -0.005 |
| -3.76400000000022 | -98.501 | -0.447 | -0.005 |
| -3.76000000000022 | -98.571 | -0.449 | -0.005 |
| -3.75600000000022 | -98.641 | -0.45 | -0.005 |
| -3.75200000000022 | -98.711 | -0.452 | -0.005 |
| -3.74800000000022 | -98.781 | -0.454 | -0.005 |
| -3.74400000000022 | -98.85 | -0.455 | -0.005 |
| -3.74000000000022 | -98.92 | -0.457 | -0.005 |
| -3.73600000000022 | -98.99 | -0.458 | -0.005 |
| -3.73200000000022 | -99.059 | -0.46 | -0.005 |
| -3.72800000000022 | -99.128 | -0.462 | -0.006 |
| -3.72400000000022 | -99.197 | -0.463 | -0.006 |
| -3.72000000000022 | -99.267 | -0.465 | -0.006 |
| -3.71600000000022 | -99.336 | -0.467 | -0.006 |
| -3.71200000000022 | -99.404 | -0.468 | -0.006 |
| -3.70800000000022 | -99.473 | -0.47 | -0.006 |
| -3.70400000000022 | -99.542 | -0.472 | -0.006 |
| -3.70000000000022 | -99.611 | -0.474 | -0.006 |
| -3.69600000000022 | -99.679 | -0.475 | -0.006 |
| -3.69200000000022 | -99.748 | -0.477 | -0.006 |
| -3.68800000000022 | -99.816 | -0.479 | -0.006 |
| -3.68400000000022 | -99.884 | -0.48 | -0.006 |
| -3.68000000000022 | -99.952 | -0.482 | -0.006 |
| -3.67600000000022 | -100.02 | -0.484 | -0.006 |
| -3.67200000000022 | -100.088 | -0.486 | -0.006 |
| -3.66800000000022 | -100.156 | -0.487 | -0.006 |
| -3.66400000000022 | -100.224 | -0.489 | -0.006 |
| -3.66000000000022 | -100.292 | -0.491 | -0.006 |
| -3.65600000000022 | -100.359 | -0.492 | -0.006 |
| -3.65200000000022 | -100.427 | -0.494 | -0.006 |
| -3.64800000000022 | -100.494 | -0.496 | -0.006 |
| -3.64400000000022 | -100.561 | -0.498 | -0.006 |
| -3.64000000000022 | -100.628 | -0.499 | -0.006 |
| -3.63600000000022 | -100.695 | -0.501 | -0.007 |
| -3.63200000000022 | -100.762 | -0.503 | -0.007 |
| -3.62800000000022 | -100.829 | -0.505 | -0.007 |
| -3.62400000000022 | -100.896 | -0.507 | -0.007 |
| -3.62000000000022 | -100.963 | -0.508 | -0.007 |
| -3.61600000000022 | -101.029 | -0.51 | -0.007 |
| -3.61200000000022 | -101.096 | -0.512 | -0.007 |
| -3.60800000000022 | -101.162 | -0.514 | -0.007 |
| -3.60400000000022 | -101.228 | -0.516 | -0.007 |
| -3.60000000000022 | -101.294 | -0.517 | -0.007 |
| -3.59600000000022 | -101.36 | -0.519 | -0.007 |
| -3.59200000000022 | -101.426 | -0.521 | -0.007 |
| -3.58800000000022 | -101.492 | -0.523 | -0.007 |
| -3.58400000000022 | -101.558 | -0.525 | -0.007 |
| -3.58000000000022 | -101.623 | -0.526 | -0.007 |
| -3.57600000000022 | -101.689 | -0.528 | -0.007 |
| -3.57200000000022 | -101.754 | -0.53 | -0.007 |
| -3.56800000000022 | -101.82 | -0.532 | -0.007 |
| -3.56400000000022 | -101.885 | -0.534 | -0.007 |
| -3.56000000000022 | -101.95 | -0.536 | -0.007 |
| -3.55600000000022 | -102.015 | -0.537 | -0.008 |
| -3.55200000000022 | -102.08 | -0.539 | -0.008 |
| -3.54800000000022 | -102.145 | -0.541 | -0.008 |
| -3.54400000000022 | -102.209 | -0.543 | -0.008 |
| -3.54000000000022 | -102.274 | -0.545 | -0.008 |
| -3.53600000000022 | -102.338 | -0.547 | -0.008 |
| -3.53200000000022 | -102.403 | -0.549 | -0.008 |
| -3.52800000000022 | -102.467 | -0.551 | -0.008 |
| -3.52400000000022 | -102.531 | -0.552 | -0.008 |
| -3.52000000000022 | -102.595 | -0.554 | -0.008 |
| -3.51600000000022 | -102.659 | -0.556 | -0.008 |
| -3.51200000000022 | -102.723 | -0.558 | -0.008 |
| -3.50800000000022 | -102.787 | -0.56 | -0.008 |
| -3.50400000000022 | -102.85 | -0.562 | -0.008 |
| -3.50000000000022 | -102.914 | -0.564 | -0.008 |
| -3.49600000000022 | -102.977 | -0.566 | -0.008 |
| -3.49200000000022 | -103.04 | -0.568 | -0.008 |
| -3.48800000000022 | -103.103 | -0.57 | -0.008 |
| -3.48400000000022 | -103.167 | -0.572 | -0.009 |
| -3.48000000000022 | -103.229 | -0.573 | -0.009 |
| -3.47600000000022 | -103.292 | -0.575 | -0.009 |
| -3.47200000000022 | -103.355 | -0.577 | -0.009 |
| -3.46800000000022 | -103.418 | -0.579 | -0.009 |
| -3.46400000000022 | -103.48 | -0.581 | -0.009 |
| -3.46000000000022 | -103.543 | -0.583 | -0.009 |
| -3.45600000000022 | -103.605 | -0.585 | -0.009 |
| -3.45200000000022 | -103.667 | -0.587 | -0.009 |
| -3.44800000000022 | -103.729 | -0.589 | -0.009 |
| -3.44400000000022 | -103.791 | -0.591 | -0.009 |
| -3.44000000000022 | -103.853 | -0.593 | -0.009 |
| -3.43600000000022 | -103.915 | -0.595 | -0.009 |
| -3.43200000000022 | -103.976 | -0.597 | -0.009 |
| -3.42800000000022 | -104.038 | -0.599 | -0.009 |
| -3.42400000000022 | -104.099 | -0.601 | -0.009 |
| -3.42000000000022 | -104.16 | -0.603 | -0.01 |
| -3.41600000000022 | -104.222 | -0.605 | -0.01 |
| -3.41200000000022 | -104.283 | -0.607 | -0.01 |
| -3.40800000000022 | -104.344 | -0.609 | -0.01 |
| -3.40400000000022 | -104.404 | -0.611 | -0.01 |
| -3.40000000000022 | -104.465 | -0.613 | -0.01 |
| -3.39600000000022 | -104.526 | -0.615 | -0.01 |
| -3.39200000000022 | -104.586 | -0.617 | -0.01 |
| -3.38800000000022 | -104.647 | -0.619 | -0.01 |
| -3.38400000000022 | -104.707 | -0.621 | -0.01 |
| -3.38000000000022 | -104.767 | -0.623 | -0.01 |
| -3.37600000000022 | -104.827 | -0.625 | -0.01 |
| -3.37200000000022 | -104.887 | -0.627 | -0.01 |
| -3.36800000000022 | -104.947 | -0.629 | -0.01 |
| -3.36400000000022 | -105.006 | -0.631 | -0.01 |
| -3.36000000000022 | -105.066 | -0.634 | -0.011 |
| -3.35600000000022 | -105.125 | -0.636 | -0.011 |
| -3.35200000000022 | -105.185 | -0.638 | -0.011 |
| -3.34800000000022 | -105.244 | -0.64 | -0.011 |
| -3.34400000000022 | -105.303 | -0.642 | -0.011 |
| -3.34000000000022 | -105.362 | -0.644 | -0.011 |
| -3.33600000000022 | -105.421 | -0.646 | -0.011 |
| -3.33200000000022 | -105.48 | -0.648 | -0.011 |
| -3.32800000000022 | -105.538 | -0.65 | -0.011 |
| -3.32400000000022 | -105.597 | -0.652 | -0.011 |
| -3.32000000000022 | -105.655 | -0.654 | -0.011 |
| -3.31600000000022 | -105.713 | -0.657 | -0.011 |
| -3.31200000000022 | -105.771 | -0.659 | -0.011 |
| -3.30800000000022 | -105.83 | -0.661 | -0.012 |
| -3.30400000000022 | -105.887 | -0.663 | -0.012 |
| -3.30000000000022 | -105.945 | -0.665 | -0.012 |
| -3.29600000000022 | -106.003 | -0.667 | -0.012 |
| -3.29200000000022 | -106.06 | -0.669 | -0.012 |
| -3.28800000000022 | -106.118 | -0.671 | -0.012 |
| -3.28400000000022 | -106.175 | -0.674 | -0.012 |
| -3.28000000000022 | -106.232 | -0.676 | -0.012 |
| -3.27600000000022 | -106.289 | -0.678 | -0.012 |
| -3.27200000000022 | -106.346 | -0.68 | -0.012 |
| -3.26800000000022 | -106.403 | -0.682 | -0.012 |
| -3.26400000000022 | -106.46 | -0.684 | -0.012 |
| -3.26000000000022 | -106.517 | -0.687 | -0.012 |
| -3.25600000000022 | -106.573 | -0.689 | -0.013 |
| -3.25200000000022 | -106.629 | -0.691 | -0.013 |
| -3.24800000000022 | -106.686 | -0.693 | -0.013 |
| -3.24400000000022 | -106.742 | -0.695 | -0.013 |
| -3.24000000000022 | -106.798 | -0.697 | -0.013 |
| -3.23600000000022 | -106.854 | -0.7 | -0.013 |
| -3.23200000000022 | -106.909 | -0.702 | -0.013 |
| -3.22800000000022 | -106.965 | -0.704 | -0.013 |
| -3.22400000000022 | -107.021 | -0.706 | -0.013 |
| -3.22000000000022 | -107.076 | -0.708 | -0.013 |
| -3.21600000000022 | -107.131 | -0.711 | -0.013 |
| -3.21200000000022 | -107.186 | -0.713 | -0.014 |
| -3.20800000000022 | -107.241 | -0.715 | -0.014 |
| -3.20400000000022 | -107.296 | -0.717 | -0.014 |
| -3.20000000000022 | -107.351 | -0.72 | -0.014 |
| -3.19600000000022 | -107.406 | -0.722 | -0.014 |
| -3.19200000000022 | -107.46 | -0.724 | -0.014 |
| -3.18800000000022 | -107.515 | -0.726 | -0.014 |
| -3.18400000000022 | -107.569 | -0.728 | -0.014 |
| -3.18000000000022 | -107.623 | -0.731 | -0.014 |
| -3.17600000000022 | -107.677 | -0.733 | -0.014 |
| -3.17200000000022 | -107.731 | -0.735 | -0.014 |
| -3.16800000000022 | -107.785 | -0.737 | -0.015 |
| -3.16400000000022 | -107.838 | -0.74 | -0.015 |
| -3.16000000000022 | -107.892 | -0.742 | -0.015 |
| -3.15600000000022 | -107.945 | -0.744 | -0.015 |
| -3.152000000000219 | -107.999 | -0.747 | -0.015 |
| -3.148000000000219 | -108.052 | -0.749 | -0.015 |
| -3.144000000000219 | -108.105 | -0.751 | -0.015 |
| -3.140000000000219 | -108.158 | -0.753 | -0.015 |
| -3.136000000000219 | -108.211 | -0.756 | -0.015 |
| -3.132000000000219 | -108.263 | -0.758 | -0.015 |
| -3.128000000000219 | -108.316 | -0.76 | -0.016 |
| -3.124000000000219 | -108.368 | -0.763 | -0.016 |
| -3.120000000000219 | -108.42 | -0.765 | -0.016 |
| -3.116000000000219 | -108.473 | -0.767 | -0.016 |
| -3.112000000000219 | -108.525 | -0.77 | -0.016 |
| -3.108000000000219 | -108.577 | -0.772 | -0.016 |
| -3.104000000000219 | -108.628 | -0.774 | -0.016 |
| -3.100000000000219 | -108.68 | -0.776 | -0.016 |
| -3.096000000000219 | -108.731 | -0.779 | -0.016 |
| -3.092000000000219 | -108.783 | -0.781 | -0.016 |
| -3.088000000000219 | -108.834 | -0.783 | -0.017 |
| -3.084000000000219 | -108.885 | -0.786 | -0.017 |
| -3.080000000000219 | -108.936 | -0.788 | -0.017 |
| -3.076000000000219 | -108.987 | -0.79 | -0.017 |
| -3.072000000000219 | -109.038 | -0.793 | -0.017 |
| -3.068000000000219 | -109.089 | -0.795 | -0.017 |
| -3.064000000000219 | -109.139 | -0.798 | -0.017 |
| -3.060000000000219 | -109.189 | -0.8 | -0.017 |
| -3.056000000000219 | -109.24 | -0.802 | -0.017 |
| -3.052000000000219 | -109.29 | -0.805 | -0.018 |
| -3.048000000000219 | -109.34 | -0.807 | -0.018 |
| -3.044000000000219 | -109.39 | -0.809 | -0.018 |
| -3.040000000000219 | -109.439 | -0.812 | -0.018 |
| -3.036000000000219 | -109.489 | -0.814 | -0.018 |
| -3.032000000000219 | -109.539 | -0.816 | -0.018 |
| -3.028000000000219 | -109.588 | -0.819 | -0.018 |
| -3.024000000000219 | -109.637 | -0.821 | -0.018 |
| -3.020000000000219 | -109.686 | -0.824 | -0.018 |
| -3.016000000000219 | -109.735 | -0.826 | -0.019 |
| -3.012000000000219 | -109.784 | -0.828 | -0.019 |
| -3.008000000000219 | -109.833 | -0.831 | -0.019 |
| -3.004000000000219 | -109.881 | -0.833 | -0.019 |
| -3.000000000000219 | -109.93 | -0.836 | -0.019 |
| -2.996000000000219 | -109.978 | -0.838 | -0.019 |
| -2.992000000000219 | -110.026 | -0.84 | -0.019 |
| -2.988000000000219 | -110.074 | -0.843 | -0.019 |
| -2.984000000000219 | -110.122 | -0.845 | -0.02 |
| -2.980000000000219 | -110.17 | -0.848 | -0.02 |
| -2.976000000000219 | -110.218 | -0.85 | -0.02 |
| -2.972000000000219 | -110.265 | -0.853 | -0.02 |
| -2.968000000000219 | -110.313 | -0.855 | -0.02 |
| -2.964000000000219 | -110.36 | -0.857 | -0.02 |
| -2.960000000000219 | -110.407 | -0.86 | -0.02 |
| -2.956000000000219 | -110.454 | -0.862 | -0.02 |
| -2.952000000000219 | -110.501 | -0.865 | -0.021 |
| -2.948000000000219 | -110.548 | -0.867 | -0.021 |
| -2.944000000000219 | -110.595 | -0.87 | -0.021 |
| -2.940000000000219 | -110.641 | -0.872 | -0.021 |
| -2.936000000000219 | -110.688 | -0.875 | -0.021 |
| -2.932000000000219 | -110.734 | -0.877 | -0.021 |
| -2.928000000000219 | -110.78 | -0.88 | -0.021 |
| -2.924000000000219 | -110.826 | -0.882 | -0.021 |
| -2.920000000000219 | -110.872 | -0.884 | -0.022 |
| -2.916000000000219 | -110.918 | -0.887 | -0.022 |
| -2.912000000000219 | -110.963 | -0.889 | -0.022 |
| -2.908000000000219 | -111.009 | -0.892 | -0.022 |
| -2.904000000000219 | -111.054 | -0.894 | -0.022 |
| -2.900000000000219 | -111.099 | -0.897 | -0.022 |
| -2.896000000000219 | -111.144 | -0.899 | -0.022 |
| -2.892000000000219 | -111.189 | -0.902 | -0.023 |
| -2.888000000000219 | -111.234 | -0.904 | -0.023 |
| -2.884000000000219 | -111.279 | -0.907 | -0.023 |
| -2.880000000000219 | -111.323 | -0.909 | -0.023 |
| -2.876000000000219 | -111.368 | -0.912 | -0.023 |
| -2.872000000000219 | -111.412 | -0.914 | -0.023 |
| -2.868000000000219 | -111.456 | -0.917 | -0.023 |
| -2.864000000000219 | -111.5 | -0.919 | -0.024 |
| -2.860000000000219 | -111.544 | -0.922 | -0.024 |
| -2.856000000000219 | -111.588 | -0.924 | -0.024 |
| -2.852000000000219 | -111.631 | -0.927 | -0.024 |
| -2.848000000000219 | -111.675 | -0.929 | -0.024 |
| -2.844000000000219 | -111.718 | -0.932 | -0.024 |
| -2.840000000000219 | -111.762 | -0.934 | -0.024 |
| -2.836000000000219 | -111.805 | -0.937 | -0.025 |
| -2.832000000000219 | -111.848 | -0.939 | -0.025 |
| -2.828000000000219 | -111.891 | -0.942 | -0.025 |
| -2.824000000000219 | -111.933 | -0.945 | -0.025 |
| -2.820000000000219 | -111.976 | -0.947 | -0.025 |
| -2.816000000000219 | -112.018 | -0.95 | -0.025 |
| -2.812000000000219 | -112.061 | -0.952 | -0.025 |
| -2.808000000000219 | -112.103 | -0.955 | -0.026 |
| -2.804000000000219 | -112.145 | -0.957 | -0.026 |
| -2.800000000000219 | -112.187 | -0.96 | -0.026 |
| -2.796000000000219 | -112.229 | -0.962 | -0.026 |
| -2.792000000000219 | -112.27 | -0.965 | -0.026 |
| -2.78800000000022 | -112.312 | -0.967 | -0.026 |
| -2.78400000000022 | -112.353 | -0.97 | -0.027 |
| -2.78000000000022 | -112.394 | -0.972 | -0.027 |
| -2.776000000000219 | -112.436 | -0.975 | -0.027 |
| -2.772000000000219 | -112.477 | -0.978 | -0.027 |
| -2.76800000000022 | -112.517 | -0.98 | -0.027 |
| -2.76400000000022 | -112.558 | -0.983 | -0.027 |
| -2.76000000000022 | -112.599 | -0.985 | -0.027 |
| -2.756000000000219 | -112.639 | -0.988 | -0.028 |
| -2.752000000000219 | -112.68 | -0.99 | -0.028 |
| -2.74800000000022 | -112.72 | -0.993 | -0.028 |
| -2.74400000000022 | -112.76 | -0.996 | -0.028 |
| -2.74000000000022 | -112.8 | -0.998 | -0.028 |
| -2.736000000000219 | -112.84 | -1.001 | -0.028 |
| -2.732000000000219 | -112.879 | -1.003 | -0.029 |
| -2.72800000000022 | -112.919 | -1.006 | -0.029 |
| -2.72400000000022 | -112.958 | -1.008 | -0.029 |
| -2.72000000000022 | -112.998 | -1.011 | -0.029 |
| -2.716000000000219 | -113.037 | -1.014 | -0.029 |
| -2.712000000000219 | -113.076 | -1.016 | -0.029 |
| -2.70800000000022 | -113.115 | -1.019 | -0.03 |
| -2.70400000000022 | -113.154 | -1.021 | -0.03 |
| -2.70000000000022 | -113.192 | -1.024 | -0.03 |
| -2.696000000000219 | -113.231 | -1.027 | -0.03 |
| -2.692000000000219 | -113.269 | -1.029 | -0.03 |
| -2.688000000000219 | -113.307 | -1.032 | -0.031 |
| -2.684000000000219 | -113.345 | -1.034 | -0.031 |
| -2.680000000000219 | -113.383 | -1.037 | -0.031 |
| -2.676000000000219 | -113.421 | -1.04 | -0.031 |
| -2.672000000000219 | -113.459 | -1.042 | -0.031 |
| -2.668000000000219 | -113.497 | -1.045 | -0.031 |
| -2.664000000000219 | -113.534 | -1.047 | -0.032 |
| -2.660000000000219 | -113.571 | -1.05 | -0.032 |
| -2.656000000000219 | -113.609 | -1.053 | -0.032 |
| -2.652000000000219 | -113.646 | -1.055 | -0.032 |
| -2.648000000000219 | -113.683 | -1.058 | -0.032 |
| -2.644000000000219 | -113.719 | -1.06 | -0.033 |
| -2.640000000000219 | -113.756 | -1.063 | -0.033 |
| -2.636000000000219 | -113.793 | -1.066 | -0.033 |
| -2.632000000000219 | -113.829 | -1.068 | -0.033 |
| -2.628000000000219 | -113.865 | -1.071 | -0.033 |
| -2.624000000000219 | -113.901 | -1.073 | -0.033 |
| -2.620000000000219 | -113.937 | -1.076 | -0.034 |
| -2.616000000000219 | -113.973 | -1.079 | -0.034 |
| -2.612000000000219 | -114.009 | -1.081 | -0.034 |
| -2.608000000000219 | -114.045 | -1.084 | -0.034 |
| -2.604000000000219 | -114.08 | -1.087 | -0.034 |
| -2.600000000000219 | -114.116 | -1.089 | -0.035 |
| -2.596000000000219 | -114.151 | -1.092 | -0.035 |
| -2.592000000000219 | -114.186 | -1.094 | -0.035 |
| -2.588000000000219 | -114.221 | -1.097 | -0.035 |
| -2.584000000000219 | -114.256 | -1.1 | -0.035 |
| -2.580000000000219 | -114.29 | -1.102 | -0.036 |
| -2.576000000000219 | -114.325 | -1.105 | -0.036 |
| -2.572000000000219 | -114.359 | -1.108 | -0.036 |
| -2.568000000000219 | -114.394 | -1.11 | -0.036 |
| -2.564000000000219 | -114.428 | -1.113 | -0.036 |
| -2.560000000000219 | -114.462 | -1.115 | -0.037 |
| -2.556000000000219 | -114.496 | -1.118 | -0.037 |
| -2.552000000000219 | -114.53 | -1.121 | -0.037 |
| -2.548000000000219 | -114.563 | -1.123 | -0.037 |
| -2.544000000000219 | -114.597 | -1.126 | -0.037 |
| -2.540000000000219 | -114.63 | -1.129 | -0.038 |
| -2.536000000000219 | -114.664 | -1.131 | -0.038 |
| -2.532000000000219 | -114.697 | -1.134 | -0.038 |
| -2.528000000000219 | -114.73 | -1.137 | -0.038 |
| -2.524000000000219 | -114.763 | -1.139 | -0.038 |
| -2.520000000000219 | -114.796 | -1.142 | -0.039 |
| -2.516000000000219 | -114.828 | -1.144 | -0.039 |
| -2.512000000000219 | -114.861 | -1.147 | -0.039 |
| -2.508000000000219 | -114.893 | -1.15 | -0.039 |
| -2.504000000000219 | -114.925 | -1.152 | -0.04 |
| -2.500000000000219 | -114.957 | -1.155 | -0.04 |
| -2.496000000000219 | -114.989 | -1.158 | -0.04 |
| -2.492000000000219 | -115.021 | -1.16 | -0.04 |
| -2.488000000000219 | -115.053 | -1.163 | -0.04 |
| -2.484000000000219 | -115.085 | -1.165 | -0.041 |
| -2.480000000000219 | -115.116 | -1.168 | -0.041 |
| -2.476000000000219 | -115.148 | -1.171 | -0.041 |
| -2.472000000000219 | -115.179 | -1.173 | -0.041 |
| -2.468000000000219 | -115.21 | -1.176 | -0.041 |
| -2.464000000000219 | -115.241 | -1.179 | -0.042 |
| -2.460000000000219 | -115.272 | -1.181 | -0.042 |
| -2.456000000000219 | -115.302 | -1.184 | -0.042 |
| -2.452000000000219 | -115.333 | -1.187 | -0.042 |
| -2.448000000000219 | -115.364 | -1.189 | -0.043 |
| -2.444000000000219 | -115.394 | -1.192 | -0.043 |
| -2.440000000000219 | -115.424 | -1.194 | -0.043 |
| -2.436000000000219 | -115.454 | -1.197 | -0.043 |
| -2.432000000000219 | -115.484 | -1.2 | -0.044 |
| -2.428000000000219 | -115.514 | -1.202 | -0.044 |
| -2.424000000000219 | -115.544 | -1.205 | -0.044 |
| -2.420000000000219 | -115.573 | -1.208 | -0.044 |
| -2.416000000000219 | -115.603 | -1.21 | -0.044 |
| -2.412000000000219 | -115.632 | -1.213 | -0.045 |
| -2.408000000000219 | -115.661 | -1.215 | -0.045 |
| -2.404000000000219 | -115.69 | -1.218 | -0.045 |
| -2.400000000000219 | -115.719 | -1.221 | -0.045 |
| -2.396000000000219 | -115.748 | -1.223 | -0.046 |
| -2.392000000000219 | -115.777 | -1.226 | -0.046 |
| -2.388000000000219 | -115.805 | -1.228 | -0.046 |
| -2.384000000000219 | -115.834 | -1.231 | -0.046 |
| -2.380000000000219 | -115.862 | -1.234 | -0.047 |
| -2.376000000000219 | -115.89 | -1.236 | -0.047 |
| -2.372000000000219 | -115.918 | -1.239 | -0.047 |
| -2.368000000000219 | -115.946 | -1.242 | -0.047 |
| -2.364000000000219 | -115.974 | -1.244 | -0.048 |
| -2.360000000000219 | -116.002 | -1.247 | -0.048 |
| -2.356000000000219 | -116.03 | -1.249 | -0.048 |
| -2.352000000000219 | -116.057 | -1.252 | -0.048 |
| -2.348000000000219 | -116.084 | -1.255 | -0.049 |
| -2.344000000000219 | -116.112 | -1.257 | -0.049 |
| -2.340000000000219 | -116.139 | -1.26 | -0.049 |
| -2.336000000000219 | -116.166 | -1.262 | -0.049 |
| -2.332000000000219 | -116.193 | -1.265 | -0.05 |
| -2.328000000000219 | -116.219 | -1.268 | -0.05 |
| -2.324000000000219 | -116.246 | -1.27 | -0.05 |
| -2.320000000000219 | -116.272 | -1.273 | -0.05 |
| -2.316000000000219 | -116.299 | -1.275 | -0.051 |
| -2.312000000000219 | -116.325 | -1.278 | -0.051 |
| -2.308000000000219 | -116.351 | -1.281 | -0.051 |
| -2.304000000000219 | -116.377 | -1.283 | -0.051 |
| -2.300000000000219 | -116.403 | -1.286 | -0.052 |
| -2.296000000000219 | -116.429 | -1.288 | -0.052 |
| -2.292000000000219 | -116.454 | -1.291 | -0.052 |
| -2.288000000000219 | -116.48 | -1.294 | -0.052 |
| -2.284000000000219 | -116.505 | -1.296 | -0.053 |
| -2.280000000000219 | -116.53 | -1.299 | -0.053 |
| -2.276000000000219 | -116.556 | -1.301 | -0.053 |
| -2.272000000000219 | -116.581 | -1.304 | -0.053 |
| -2.268000000000219 | -116.606 | -1.306 | -0.054 |
| -2.264000000000219 | -116.63 | -1.309 | -0.054 |
| -2.260000000000219 | -116.655 | -1.312 | -0.054 |
| -2.256000000000219 | -116.68 | -1.314 | -0.055 |
| -2.252000000000219 | -116.704 | -1.317 | -0.055 |
| -2.248000000000219 | -116.728 | -1.319 | -0.055 |
| -2.244000000000219 | -116.752 | -1.322 | -0.055 |
| -2.240000000000219 | -116.777 | -1.324 | -0.056 |
| -2.236000000000219 | -116.801 | -1.327 | -0.056 |
| -2.232000000000219 | -116.824 | -1.33 | -0.056 |
| -2.228000000000219 | -116.848 | -1.332 | -0.056 |
| -2.224000000000219 | -116.872 | -1.335 | -0.057 |
| -2.220000000000219 | -116.895 | -1.337 | -0.057 |
| -2.216000000000219 | -116.919 | -1.34 | -0.057 |
| -2.212000000000219 | -116.942 | -1.342 | -0.058 |
| -2.208000000000219 | -116.965 | -1.345 | -0.058 |
| -2.204000000000219 | -116.988 | -1.347 | -0.058 |
| -2.200000000000219 | -117.011 | -1.35 | -0.058 |
| -2.196000000000219 | -117.034 | -1.352 | -0.059 |
| -2.192000000000219 | -117.056 | -1.355 | -0.059 |
| -2.188000000000219 | -117.079 | -1.357 | -0.059 |
| -2.184000000000219 | -117.101 | -1.36 | -0.06 |
| -2.180000000000219 | -117.124 | -1.362 | -0.06 |
| -2.176000000000219 | -117.146 | -1.365 | -0.06 |
| -2.172000000000219 | -117.168 | -1.367 | -0.06 |
| -2.168000000000219 | -117.19 | -1.37 | -0.061 |
| -2.164000000000219 | -117.212 | -1.372 | -0.061 |
| -2.160000000000219 | -117.233 | -1.375 | -0.061 |
| -2.156000000000219 | -117.255 | -1.377 | -0.062 |
| -2.152000000000219 | -117.277 | -1.38 | -0.062 |
| -2.148000000000219 | -117.298 | -1.382 | -0.062 |
| -2.144000000000219 | -117.319 | -1.385 | -0.062 |
| -2.140000000000219 | -117.34 | -1.387 | -0.063 |
| -2.136000000000219 | -117.362 | -1.39 | -0.063 |
| -2.132000000000219 | -117.383 | -1.392 | -0.063 |
| -2.128000000000219 | -117.403 | -1.395 | -0.064 |
| -2.124000000000219 | -117.424 | -1.397 | -0.064 |
| -2.120000000000219 | -117.445 | -1.4 | -0.064 |
| -2.116000000000219 | -117.465 | -1.402 | -0.064 |
| -2.112000000000219 | -117.486 | -1.405 | -0.065 |
| -2.108000000000219 | -117.506 | -1.407 | -0.065 |
| -2.104000000000219 | -117.526 | -1.41 | -0.065 |
| -2.100000000000219 | -117.546 | -1.412 | -0.066 |
| -2.096000000000219 | -117.566 | -1.415 | -0.066 |
| -2.092000000000219 | -117.586 | -1.417 | -0.066 |
| -2.088000000000219 | -117.606 | -1.419 | -0.067 |
| -2.084000000000219 | -117.625 | -1.422 | -0.067 |
| -2.080000000000219 | -117.645 | -1.424 | -0.067 |
| -2.076000000000219 | -117.664 | -1.427 | -0.067 |
| -2.072000000000219 | -117.683 | -1.429 | -0.068 |
| -2.068000000000219 | -117.703 | -1.432 | -0.068 |
| -2.064000000000219 | -117.722 | -1.434 | -0.068 |
| -2.060000000000219 | -117.741 | -1.436 | -0.069 |
| -2.056000000000219 | -117.76 | -1.439 | -0.069 |
| -2.052000000000219 | -117.778 | -1.441 | -0.069 |
| -2.048000000000219 | -117.797 | -1.444 | -0.07 |
| -2.044000000000219 | -117.815 | -1.446 | -0.07 |
| -2.040000000000219 | -117.834 | -1.448 | -0.07 |
| -2.036000000000219 | -117.852 | -1.451 | -0.071 |
| -2.032000000000219 | -117.87 | -1.453 | -0.071 |
| -2.028000000000219 | -117.889 | -1.456 | -0.071 |
| -2.024000000000219 | -117.907 | -1.458 | -0.071 |
| -2.020000000000219 | -117.924 | -1.46 | -0.072 |
| -2.016000000000219 | -117.942 | -1.463 | -0.072 |
| -2.012000000000219 | -117.96 | -1.465 | -0.072 |
| -2.008000000000218 | -117.978 | -1.467 | -0.073 |
| -2.004000000000218 | -117.995 | -1.47 | -0.073 |
| -2.000000000000218 | -118.012 | -1.472 | -0.073 |
| -1.996000000000218 | -118.03 | -1.474 | -0.074 |
| -1.992000000000218 | -118.047 | -1.477 | -0.074 |
| -1.988000000000218 | -118.064 | -1.479 | -0.074 |
| -1.984000000000218 | -118.081 | -1.481 | -0.075 |
| -1.980000000000218 | -118.098 | -1.484 | -0.075 |
| -1.976000000000218 | -118.114 | -1.486 | -0.075 |
| -1.972000000000218 | -118.131 | -1.488 | -0.076 |
| -1.968000000000218 | -118.148 | -1.491 | -0.076 |
| -1.964000000000218 | -118.164 | -1.493 | -0.076 |
| -1.960000000000218 | -118.18 | -1.495 | -0.077 |
| -1.956000000000218 | -118.197 | -1.498 | -0.077 |
| -1.952000000000218 | -118.213 | -1.5 | -0.077 |
| -1.948000000000218 | -118.229 | -1.502 | -0.078 |
| -1.944000000000218 | -118.245 | -1.504 | -0.078 |
| -1.940000000000218 | -118.261 | -1.507 | -0.078 |
| -1.936000000000218 | -118.276 | -1.509 | -0.079 |
| -1.932000000000218 | -118.292 | -1.511 | -0.079 |
| -1.928000000000218 | -118.308 | -1.514 | -0.079 |
| -1.924000000000218 | -118.323 | -1.516 | -0.079 |
| -1.920000000000218 | -118.338 | -1.518 | -0.08 |
| -1.916000000000218 | -118.354 | -1.52 | -0.08 |
| -1.912000000000218 | -118.369 | -1.522 | -0.08 |
| -1.908000000000218 | -118.384 | -1.525 | -0.081 |
| -1.904000000000218 | -118.399 | -1.527 | -0.081 |
| -1.900000000000218 | -118.414 | -1.529 | -0.081 |
| -1.896000000000218 | -118.428 | -1.531 | -0.082 |
| -1.892000000000218 | -118.443 | -1.534 | -0.082 |
| -1.888000000000218 | -118.458 | -1.536 | -0.082 |
| -1.884000000000218 | -118.472 | -1.538 | -0.083 |
| -1.880000000000218 | -118.487 | -1.54 | -0.083 |
| -1.876000000000218 | -118.501 | -1.542 | -0.083 |
| -1.872000000000218 | -118.515 | -1.545 | -0.084 |
| -1.868000000000218 | -118.529 | -1.547 | -0.084 |
| -1.864000000000218 | -118.543 | -1.549 | -0.084 |
| -1.860000000000218 | -118.557 | -1.551 | -0.085 |
| -1.856000000000218 | -118.571 | -1.553 | -0.085 |
| -1.852000000000218 | -118.585 | -1.555 | -0.085 |
| -1.848000000000218 | -118.598 | -1.557 | -0.086 |
| -1.844000000000218 | -118.612 | -1.56 | -0.086 |
| -1.840000000000218 | -118.625 | -1.562 | -0.087 |
| -1.836000000000218 | -118.639 | -1.564 | -0.087 |
| -1.832000000000218 | -118.652 | -1.566 | -0.087 |
| -1.828000000000218 | -118.665 | -1.568 | -0.088 |
| -1.824000000000218 | -118.678 | -1.57 | -0.088 |
| -1.820000000000218 | -118.691 | -1.572 | -0.088 |
| -1.816000000000218 | -118.704 | -1.574 | -0.089 |
| -1.812000000000218 | -118.717 | -1.576 | -0.089 |
| -1.808000000000218 | -118.729 | -1.579 | -0.089 |
| -1.804000000000218 | -118.742 | -1.581 | -0.09 |
| -1.800000000000218 | -118.755 | -1.583 | -0.09 |
| -1.796000000000218 | -118.767 | -1.585 | -0.09 |
| -1.792000000000218 | -118.779 | -1.587 | -0.091 |
| -1.788000000000218 | -118.792 | -1.589 | -0.091 |
| -1.784000000000218 | -118.804 | -1.591 | -0.091 |
| -1.780000000000218 | -118.816 | -1.593 | -0.092 |
| -1.776000000000218 | -118.828 | -1.595 | -0.092 |
| -1.772000000000218 | -118.84 | -1.597 | -0.092 |
| -1.768000000000218 | -118.852 | -1.599 | -0.093 |
| -1.764000000000218 | -118.864 | -1.601 | -0.093 |
| -1.760000000000218 | -118.875 | -1.603 | -0.093 |
| -1.756000000000218 | -118.887 | -1.605 | -0.094 |
| -1.752000000000218 | -118.898 | -1.607 | -0.094 |
| -1.748000000000218 | -118.91 | -1.609 | -0.094 |
| -1.744000000000218 | -118.921 | -1.611 | -0.095 |
| -1.740000000000218 | -118.932 | -1.613 | -0.095 |
| -1.736000000000218 | -118.943 | -1.615 | -0.095 |
| -1.732000000000218 | -118.954 | -1.617 | -0.096 |
| -1.728000000000218 | -118.965 | -1.619 | -0.096 |
| -1.724000000000218 | -118.976 | -1.621 | -0.096 |
| -1.720000000000218 | -118.987 | -1.623 | -0.097 |
| -1.716000000000218 | -118.998 | -1.625 | -0.097 |
| -1.712000000000218 | -119.009 | -1.627 | -0.097 |
| -1.708000000000218 | -119.019 | -1.628 | -0.098 |
| -1.704000000000218 | -119.03 | -1.63 | -0.098 |
| -1.700000000000218 | -119.04 | -1.632 | -0.099 |
| -1.696000000000218 | -119.05 | -1.634 | -0.099 |
| -1.692000000000218 | -119.061 | -1.636 | -0.099 |
| -1.688000000000218 | -119.071 | -1.638 | -0.1 |
| -1.684000000000218 | -119.081 | -1.64 | -0.1 |
| -1.680000000000218 | -119.091 | -1.642 | -0.1 |
| -1.676000000000218 | -119.101 | -1.644 | -0.101 |
| -1.672000000000218 | -119.111 | -1.645 | -0.101 |
| -1.668000000000218 | -119.121 | -1.647 | -0.101 |
| -1.664000000000218 | -119.13 | -1.649 | -0.102 |
| -1.660000000000218 | -119.14 | -1.651 | -0.102 |
| -1.656000000000218 | -119.149 | -1.653 | -0.102 |
| -1.652000000000218 | -119.159 | -1.654 | -0.103 |
| -1.648000000000218 | -119.168 | -1.656 | -0.103 |
| -1.644000000000218 | -119.178 | -1.658 | -0.103 |
| -1.640000000000218 | -119.187 | -1.66 | -0.104 |
| -1.636000000000218 | -119.196 | -1.662 | -0.104 |
| -1.632000000000218 | -119.205 | -1.663 | -0.104 |
| -1.628000000000218 | -119.214 | -1.665 | -0.105 |
| -1.624000000000218 | -119.223 | -1.667 | -0.105 |
| -1.620000000000218 | -119.232 | -1.669 | -0.105 |
| -1.616000000000218 | -119.241 | -1.67 | -0.106 |
| -1.612000000000218 | -119.249 | -1.672 | -0.106 |
| -1.608000000000218 | -119.258 | -1.674 | -0.106 |
| -1.604000000000218 | -119.267 | -1.676 | -0.107 |
| -1.600000000000218 | -119.275 | -1.677 | -0.107 |
| -1.596000000000218 | -119.284 | -1.679 | -0.108 |
| -1.592000000000218 | -119.292 | -1.681 | -0.108 |
| -1.588000000000218 | -119.3 | -1.682 | -0.108 |
| -1.584000000000218 | -119.308 | -1.684 | -0.109 |
| -1.580000000000218 | -119.317 | -1.686 | -0.109 |
| -1.576000000000218 | -119.325 | -1.687 | -0.109 |
| -1.572000000000218 | -119.333 | -1.689 | -0.11 |
| -1.568000000000218 | -119.341 | -1.691 | -0.11 |
| -1.564000000000218 | -119.349 | -1.692 | -0.11 |
| -1.560000000000218 | -119.356 | -1.694 | -0.111 |
| -1.556000000000218 | -119.364 | -1.696 | -0.111 |
| -1.552000000000218 | -119.372 | -1.697 | -0.111 |
| -1.548000000000218 | -119.379 | -1.699 | -0.112 |
| -1.544000000000218 | -119.387 | -1.701 | -0.112 |
| -1.540000000000218 | -119.394 | -1.702 | -0.112 |
| -1.536000000000218 | -119.402 | -1.704 | -0.113 |
| -1.532000000000218 | -119.409 | -1.705 | -0.113 |
| -1.528000000000218 | -119.416 | -1.707 | -0.113 |
| -1.524000000000218 | -119.423 | -1.708 | -0.114 |
| -1.520000000000218 | -119.431 | -1.71 | -0.114 |
| -1.516000000000218 | -119.438 | -1.712 | -0.114 |
| -1.512000000000218 | -119.445 | -1.713 | -0.115 |
| -1.508000000000218 | -119.452 | -1.715 | -0.115 |
| -1.504000000000218 | -119.458 | -1.716 | -0.115 |
| -1.500000000000218 | -119.465 | -1.718 | -0.116 |
| -1.496000000000218 | -119.472 | -1.719 | -0.116 |
| -1.492000000000218 | -119.479 | -1.721 | -0.116 |
| -1.488000000000218 | -119.485 | -1.722 | -0.117 |
| -1.484000000000218 | -119.492 | -1.724 | -0.117 |
| -1.480000000000218 | -119.498 | -1.725 | -0.117 |
| -1.476000000000218 | -119.505 | -1.727 | -0.118 |
| -1.472000000000218 | -119.511 | -1.728 | -0.118 |
| -1.468000000000218 | -119.518 | -1.729 | -0.118 |
| -1.464000000000218 | -119.524 | -1.731 | -0.119 |
| -1.460000000000218 | -119.53 | -1.732 | -0.119 |
| -1.456000000000218 | -119.536 | -1.734 | -0.119 |
| -1.452000000000218 | -119.542 | -1.735 | -0.12 |
| -1.448000000000218 | -119.548 | -1.737 | -0.12 |
| -1.444000000000218 | -119.554 | -1.738 | -0.12 |
| -1.440000000000218 | -119.56 | -1.739 | -0.121 |
| -1.436000000000218 | -119.566 | -1.741 | -0.121 |
| -1.432000000000218 | -119.572 | -1.742 | -0.121 |
| -1.428000000000218 | -119.577 | -1.744 | -0.122 |
| -1.424000000000218 | -119.583 | -1.745 | -0.122 |
| -1.420000000000218 | -119.589 | -1.746 | -0.122 |
| -1.416000000000218 | -119.594 | -1.748 | -0.123 |
| -1.412000000000218 | -119.6 | -1.749 | -0.123 |
| -1.408000000000218 | -119.605 | -1.75 | -0.123 |
| -1.404000000000218 | -119.611 | -1.752 | -0.124 |
| -1.400000000000218 | -119.616 | -1.753 | -0.124 |
| -1.396000000000218 | -119.621 | -1.754 | -0.124 |
| -1.392000000000218 | -119.626 | -1.756 | -0.125 |
| -1.388000000000218 | -119.632 | -1.757 | -0.125 |
| -1.384000000000218 | -119.637 | -1.758 | -0.125 |
| -1.380000000000218 | -119.642 | -1.759 | -0.126 |
| -1.376000000000218 | -119.647 | -1.761 | -0.126 |
| -1.372000000000218 | -119.652 | -1.762 | -0.126 |
| -1.368000000000218 | -119.657 | -1.763 | -0.127 |
| -1.364000000000218 | -119.661 | -1.764 | -0.127 |
| -1.360000000000218 | -119.666 | -1.766 | -0.127 |
| -1.356000000000218 | -119.671 | -1.767 | -0.127 |
| -1.352000000000218 | -119.676 | -1.768 | -0.128 |
| -1.348000000000218 | -119.68 | -1.769 | -0.128 |
| -1.344000000000218 | -119.685 | -1.77 | -0.128 |
| -1.340000000000218 | -119.689 | -1.772 | -0.129 |
| -1.336000000000218 | -119.694 | -1.773 | -0.129 |
| -1.332000000000218 | -119.698 | -1.774 | -0.129 |
| -1.328000000000218 | -119.703 | -1.775 | -0.13 |
| -1.324000000000218 | -119.707 | -1.776 | -0.13 |
| -1.320000000000218 | -119.712 | -1.777 | -0.13 |
| -1.316000000000218 | -119.716 | -1.779 | -0.131 |
| -1.312000000000218 | -119.72 | -1.78 | -0.131 |
| -1.308000000000218 | -119.724 | -1.781 | -0.131 |
| -1.304000000000218 | -119.728 | -1.782 | -0.131 |
| -1.300000000000218 | -119.732 | -1.783 | -0.132 |
| -1.296000000000218 | -119.736 | -1.784 | -0.132 |
| -1.292000000000218 | -119.74 | -1.785 | -0.132 |
| -1.288000000000218 | -119.744 | -1.786 | -0.133 |
| -1.284000000000218 | -119.748 | -1.787 | -0.133 |
| -1.280000000000218 | -119.752 | -1.788 | -0.133 |
| -1.276000000000218 | -119.756 | -1.79 | -0.134 |
| -1.272000000000218 | -119.76 | -1.791 | -0.134 |
| -1.268000000000218 | -119.763 | -1.792 | -0.134 |
| -1.264000000000218 | -119.767 | -1.793 | -0.134 |
| -1.260000000000218 | -119.771 | -1.794 | -0.135 |
| -1.256000000000218 | -119.774 | -1.795 | -0.135 |
| -1.252000000000218 | -119.778 | -1.796 | -0.135 |
| -1.248000000000218 | -119.781 | -1.797 | -0.136 |
| -1.244000000000218 | -119.785 | -1.798 | -0.136 |
| -1.240000000000218 | -119.788 | -1.799 | -0.136 |
| -1.236000000000218 | -119.791 | -1.8 | -0.136 |
| -1.232000000000218 | -119.795 | -1.801 | -0.137 |
| -1.228000000000218 | -119.798 | -1.802 | -0.137 |
| -1.224000000000218 | -119.801 | -1.803 | -0.137 |
| -1.220000000000218 | -119.805 | -1.804 | -0.138 |
| -1.216000000000218 | -119.808 | -1.804 | -0.138 |
| -1.212000000000218 | -119.811 | -1.805 | -0.138 |
| -1.208000000000218 | -119.814 | -1.806 | -0.138 |
| -1.204000000000218 | -119.817 | -1.807 | -0.139 |
| -1.200000000000218 | -119.82 | -1.808 | -0.139 |
| -1.196000000000218 | -119.823 | -1.809 | -0.139 |
| -1.192000000000218 | -119.826 | -1.81 | -0.139 |
| -1.188000000000218 | -119.829 | -1.811 | -0.14 |
| -1.184000000000218 | -119.832 | -1.812 | -0.14 |
| -1.180000000000218 | -119.834 | -1.813 | -0.14 |
| -1.176000000000218 | -119.837 | -1.813 | -0.141 |
| -1.172000000000218 | -119.84 | -1.814 | -0.141 |
| -1.168000000000218 | -119.843 | -1.815 | -0.141 |
| -1.164000000000218 | -119.845 | -1.816 | -0.141 |
| -1.160000000000218 | -119.848 | -1.817 | -0.142 |
| -1.156000000000218 | -119.851 | -1.818 | -0.142 |
| -1.152000000000218 | -119.853 | -1.818 | -0.142 |
| -1.148000000000218 | -119.856 | -1.819 | -0.142 |
| -1.144000000000218 | -119.858 | -1.82 | -0.143 |
| -1.140000000000218 | -119.861 | -1.821 | -0.143 |
| -1.136000000000218 | -119.863 | -1.822 | -0.143 |
| -1.132000000000218 | -119.866 | -1.822 | -0.143 |
| -1.128000000000218 | -119.868 | -1.823 | -0.144 |
| -1.124000000000218 | -119.87 | -1.824 | -0.144 |
| -1.120000000000218 | -119.873 | -1.825 | -0.144 |
| -1.116000000000218 | -119.875 | -1.825 | -0.144 |
| -1.112000000000218 | -119.877 | -1.826 | -0.145 |
| -1.108000000000218 | -119.88 | -1.827 | -0.145 |
| -1.104000000000218 | -119.882 | -1.828 | -0.145 |
| -1.100000000000218 | -119.884 | -1.828 | -0.145 |
| -1.096000000000218 | -119.886 | -1.829 | -0.146 |
| -1.092000000000218 | -119.888 | -1.83 | -0.146 |
| -1.088000000000218 | -119.89 | -1.83 | -0.146 |
| -1.084000000000218 | -119.892 | -1.831 | -0.146 |
| -1.080000000000218 | -119.894 | -1.832 | -0.146 |
| -1.076000000000218 | -119.896 | -1.832 | -0.147 |
| -1.072000000000218 | -119.898 | -1.833 | -0.147 |
| -1.068000000000218 | -119.9 | -1.834 | -0.147 |
| -1.064000000000218 | -119.902 | -1.834 | -0.147 |
| -1.060000000000218 | -119.904 | -1.835 | -0.148 |
| -1.056000000000218 | -119.906 | -1.836 | -0.148 |
| -1.052000000000218 | -119.907 | -1.836 | -0.148 |
| -1.048000000000218 | -119.909 | -1.837 | -0.148 |
| -1.044000000000218 | -119.911 | -1.838 | -0.149 |
| -1.040000000000218 | -119.913 | -1.838 | -0.149 |
| -1.036000000000218 | -119.914 | -1.839 | -0.149 |
| -1.032000000000218 | -119.916 | -1.839 | -0.149 |
| -1.028000000000218 | -119.918 | -1.84 | -0.149 |
| -1.024000000000218 | -119.919 | -1.841 | -0.15 |
| -1.020000000000218 | -119.921 | -1.841 | -0.15 |
| -1.016000000000218 | -119.923 | -1.842 | -0.15 |
| -1.012000000000218 | -119.924 | -1.842 | -0.15 |
| -1.008000000000218 | -119.926 | -1.843 | -0.15 |
| -1.004000000000218 | -119.927 | -1.843 | -0.151 |
| -1.000000000000218 | -119.929 | -1.844 | -0.151 |
| -0.996000000000218 | -119.93 | -1.844 | -0.151 |
| -0.992000000000218 | -119.932 | -1.845 | -0.151 |
| -0.988000000000218 | -119.933 | -1.846 | -0.151 |
| -0.984000000000218 | -119.934 | -1.846 | -0.152 |
| -0.980000000000218 | -119.936 | -1.847 | -0.152 |
| -0.976000000000218 | -119.937 | -1.847 | -0.152 |
| -0.972000000000218 | -119.938 | -1.848 | -0.152 |
| -0.968000000000218 | -119.94 | -1.848 | -0.152 |
| -0.964000000000218 | -119.941 | -1.849 | -0.153 |
| -0.960000000000218 | -119.942 | -1.849 | -0.153 |
| -0.956000000000218 | -119.944 | -1.85 | -0.153 |
| -0.952000000000218 | -119.945 | -1.85 | -0.153 |
| -0.948000000000218 | -119.946 | -1.85 | -0.153 |
| -0.944000000000218 | -119.947 | -1.851 | -0.153 |
| -0.940000000000218 | -119.948 | -1.851 | -0.154 |
| -0.936000000000218 | -119.949 | -1.852 | -0.154 |
| -0.932000000000218 | -119.951 | -1.852 | -0.154 |
| -0.928000000000218 | -119.952 | -1.853 | -0.154 |
| -0.924000000000218 | -119.953 | -1.853 | -0.154 |
| -0.920000000000218 | -119.954 | -1.854 | -0.154 |
| -0.916000000000218 | -119.955 | -1.854 | -0.155 |
| -0.912000000000218 | -119.956 | -1.854 | -0.155 |
| -0.908000000000217 | -119.957 | -1.855 | -0.155 |
| -0.904000000000217 | -119.958 | -1.855 | -0.155 |
| -0.900000000000217 | -119.959 | -1.856 | -0.155 |
| -0.896000000000217 | -119.96 | -1.856 | -0.155 |
| -0.892000000000217 | -119.961 | -1.856 | -0.156 |
| -0.888000000000217 | -119.962 | -1.857 | -0.156 |
| -0.884000000000217 | -119.962 | -1.857 | -0.156 |
| -0.880000000000217 | -119.963 | -1.857 | -0.156 |
| -0.876000000000217 | -119.964 | -1.858 | -0.156 |
| -0.872000000000217 | -119.965 | -1.858 | -0.156 |
| -0.868000000000217 | -119.966 | -1.858 | -0.156 |
| -0.864000000000217 | -119.967 | -1.859 | -0.157 |
| -0.860000000000217 | -119.968 | -1.859 | -0.157 |
| -0.856000000000217 | -119.968 | -1.86 | -0.157 |
| -0.852000000000217 | -119.969 | -1.86 | -0.157 |
| -0.848000000000217 | -119.97 | -1.86 | -0.157 |
| -0.844000000000217 | -119.971 | -1.86 | -0.157 |
| -0.840000000000217 | -119.971 | -1.861 | -0.157 |
| -0.836000000000217 | -119.972 | -1.861 | -0.158 |
| -0.832000000000217 | -119.973 | -1.861 | -0.158 |
| -0.828000000000217 | -119.973 | -1.862 | -0.158 |
| -0.824000000000217 | -119.974 | -1.862 | -0.158 |
| -0.820000000000217 | -119.975 | -1.862 | -0.158 |
| -0.816000000000217 | -119.975 | -1.863 | -0.158 |
| -0.812000000000217 | -119.976 | -1.863 | -0.158 |
| -0.808000000000217 | -119.977 | -1.863 | -0.158 |
| -0.804000000000217 | -119.977 | -1.863 | -0.159 |
| -0.800000000000217 | -119.978 | -1.864 | -0.159 |
| -0.796000000000217 | -119.978 | -1.864 | -0.159 |
| -0.792000000000217 | -119.979 | -1.864 | -0.159 |
| -0.788000000000217 | -119.98 | -1.864 | -0.159 |
| -0.784000000000217 | -119.98 | -1.865 | -0.159 |
| -0.780000000000217 | -119.981 | -1.865 | -0.159 |
| -0.776000000000217 | -119.981 | -1.865 | -0.159 |
| -0.772000000000217 | -119.982 | -1.865 | -0.16 |
| -0.768000000000217 | -119.982 | -1.866 | -0.16 |
| -0.764000000000217 | -119.983 | -1.866 | -0.16 |
| -0.760000000000217 | -119.983 | -1.866 | -0.16 |
| -0.756000000000217 | -119.984 | -1.866 | -0.16 |
| -0.752000000000217 | -119.984 | -1.867 | -0.16 |
| -0.748000000000217 | -119.985 | -1.867 | -0.16 |
| -0.744000000000217 | -119.985 | -1.867 | -0.16 |
| -0.740000000000217 | -119.985 | -1.867 | -0.16 |
| -0.736000000000217 | -119.986 | -1.867 | -0.16 |
| -0.732000000000217 | -119.986 | -1.868 | -0.161 |
| -0.728000000000217 | -119.987 | -1.868 | -0.161 |
| -0.724000000000217 | -119.987 | -1.868 | -0.161 |
| -0.720000000000217 | -119.987 | -1.868 | -0.161 |
| -0.716000000000217 | -119.988 | -1.868 | -0.161 |
| -0.712000000000217 | -119.988 | -1.868 | -0.161 |
| -0.708000000000217 | -119.989 | -1.869 | -0.161 |
| -0.704000000000217 | -119.989 | -1.869 | -0.161 |
| -0.700000000000217 | -119.989 | -1.869 | -0.161 |
| -0.696000000000217 | -119.99 | -1.869 | -0.161 |
| -0.692000000000217 | -119.99 | -1.869 | -0.161 |
| -0.688000000000217 | -119.99 | -1.869 | -0.161 |
| -0.684000000000217 | -119.99 | -1.87 | -0.162 |
| -0.680000000000217 | -119.991 | -1.87 | -0.162 |
| -0.676000000000217 | -119.991 | -1.87 | -0.162 |
| -0.672000000000217 | -119.991 | -1.87 | -0.162 |
| -0.668000000000217 | -119.992 | -1.87 | -0.162 |
| -0.664000000000217 | -119.992 | -1.87 | -0.162 |
| -0.660000000000217 | -119.992 | -1.87 | -0.162 |
| -0.656000000000217 | -119.992 | -1.871 | -0.162 |
| -0.652000000000217 | -119.993 | -1.871 | -0.162 |
| -0.648000000000217 | -119.993 | -1.871 | -0.162 |
| -0.644000000000217 | -119.993 | -1.871 | -0.162 |
| -0.640000000000217 | -119.993 | -1.871 | -0.162 |
| -0.636000000000217 | -119.994 | -1.871 | -0.162 |
| -0.632000000000217 | -119.994 | -1.871 | -0.162 |
| -0.628000000000217 | -119.994 | -1.871 | -0.163 |
| -0.624000000000217 | -119.994 | -1.872 | -0.163 |
| -0.620000000000217 | -119.994 | -1.872 | -0.163 |
| -0.616000000000217 | -119.995 | -1.872 | -0.163 |
| -0.612000000000217 | -119.995 | -1.872 | -0.163 |
| -0.608000000000217 | -119.995 | -1.872 | -0.163 |
| -0.604000000000217 | -119.995 | -1.872 | -0.163 |
| -0.600000000000217 | -119.995 | -1.872 | -0.163 |
| -0.596000000000217 | -119.996 | -1.872 | -0.163 |
| -0.592000000000217 | -119.996 | -1.872 | -0.163 |
| -0.588000000000217 | -119.996 | -1.872 | -0.163 |
| -0.584000000000217 | -119.996 | -1.873 | -0.163 |
| -0.580000000000217 | -119.996 | -1.873 | -0.163 |
| -0.576000000000217 | -119.996 | -1.873 | -0.163 |
| -0.572000000000217 | -119.996 | -1.873 | -0.163 |
| -0.568000000000217 | -119.997 | -1.873 | -0.163 |
| -0.564000000000217 | -119.997 | -1.873 | -0.163 |
| -0.560000000000217 | -119.997 | -1.873 | -0.163 |
| -0.556000000000217 | -119.997 | -1.873 | -0.163 |
| -0.552000000000217 | -119.997 | -1.873 | -0.163 |
| -0.548000000000217 | -119.997 | -1.873 | -0.163 |
| -0.544000000000217 | -119.997 | -1.873 | -0.164 |
| -0.540000000000217 | -119.997 | -1.873 | -0.164 |
| -0.536000000000217 | -119.997 | -1.873 | -0.164 |
| -0.532000000000217 | -119.998 | -1.873 | -0.164 |
| -0.528000000000217 | -119.998 | -1.874 | -0.164 |
| -0.524000000000217 | -119.998 | -1.874 | -0.164 |
| -0.520000000000217 | -119.998 | -1.874 | -0.164 |
| -0.516000000000217 | -119.998 | -1.874 | -0.164 |
| -0.512000000000217 | -119.998 | -1.874 | -0.164 |
| -0.508000000000217 | -119.998 | -1.874 | -0.164 |
| -0.504000000000217 | -119.998 | -1.874 | -0.164 |
| -0.500000000000217 | -119.998 | -1.874 | -0.164 |
| -0.496000000000217 | -119.998 | -1.874 | -0.164 |
| -0.492000000000217 | -119.998 | -1.874 | -0.164 |
| -0.488000000000217 | -119.999 | -1.874 | -0.164 |
| -0.484000000000217 | -119.999 | -1.874 | -0.164 |
| -0.480000000000217 | -119.999 | -1.874 | -0.164 |
| -0.476000000000217 | -119.999 | -1.874 | -0.164 |
| -0.472000000000217 | -119.999 | -1.874 | -0.164 |
| -0.468000000000217 | -119.999 | -1.874 | -0.164 |
| -0.464000000000217 | -119.999 | -1.874 | -0.164 |
| -0.460000000000217 | -119.999 | -1.874 | -0.164 |
| -0.456000000000217 | -119.999 | -1.874 | -0.164 |
| -0.452000000000217 | -119.999 | -1.874 | -0.164 |
| -0.448000000000217 | -119.999 | -1.874 | -0.164 |
| -0.444000000000217 | -119.999 | -1.874 | -0.164 |
| -0.440000000000217 | -119.999 | -1.874 | -0.164 |
| -0.436000000000217 | -119.999 | -1.874 | -0.164 |
| -0.432000000000217 | -119.999 | -1.874 | -0.164 |
| -0.428000000000217 | -119.999 | -1.875 | -0.164 |
| -0.424000000000217 | -119.999 | -1.875 | -0.164 |
| -0.420000000000217 | -119.999 | -1.875 | -0.164 |
| -0.416000000000217 | -119.999 | -1.875 | -0.164 |
| -0.412000000000217 | -119.999 | -1.875 | -0.164 |
| -0.408000000000217 | -119.999 | -1.875 | -0.164 |
| -0.404000000000217 | -119.999 | -1.875 | -0.164 |
| -0.400000000000217 | -120 | -1.875 | -0.164 |
| -0.396000000000217 | -120 | -1.875 | -0.164 |
| -0.392000000000217 | -120 | -1.875 | -0.164 |
| -0.388000000000217 | -120 | -1.875 | -0.164 |
| -0.384000000000217 | -120 | -1.875 | -0.164 |
| -0.380000000000217 | -120 | -1.875 | -0.164 |
| -0.376000000000217 | -120 | -1.875 | -0.164 |
| -0.372000000000217 | -120 | -1.875 | -0.164 |
| -0.368000000000217 | -120 | -1.875 | -0.164 |
| -0.364000000000217 | -120 | -1.875 | -0.164 |
| -0.360000000000217 | -120 | -1.875 | -0.164 |
| -0.356000000000217 | -120 | -1.875 | -0.164 |
| -0.352000000000217 | -120 | -1.875 | -0.164 |
| -0.348000000000217 | -120 | -1.875 | -0.164 |
| -0.344000000000217 | -120 | -1.875 | -0.164 |
| -0.340000000000217 | -120 | -1.875 | -0.165 |
| -0.336000000000217 | -120 | -1.875 | -0.165 |
| -0.332000000000217 | -120 | -1.875 | -0.165 |
| -0.328000000000217 | -120 | -1.875 | -0.165 |
| -0.324000000000217 | -120 | -1.875 | -0.165 |
| -0.320000000000217 | -120 | -1.875 | -0.165 |
| -0.316000000000217 | -120 | -1.875 | -0.165 |
| -0.312000000000217 | -120 | -1.875 | -0.165 |
| -0.308000000000217 | -120 | -1.875 | -0.165 |
| -0.304000000000217 | -120 | -1.875 | -0.165 |
| -0.300000000000217 | -120 | -1.875 | -0.165 |
| -0.296000000000217 | -120 | -1.875 | -0.165 |
| -0.292000000000217 | -120 | -1.875 | -0.165 |
| -0.288000000000217 | -120 | -1.875 | -0.165 |
| -0.284000000000217 | -120 | -1.875 | -0.165 |
| -0.280000000000217 | -120 | -1.875 | -0.165 |
| -0.276000000000217 | -120 | -1.875 | -0.165 |
| -0.272000000000217 | -120 | -1.875 | -0.165 |
| -0.268000000000217 | -120 | -1.875 | -0.165 |
| -0.264000000000217 | -120 | -1.875 | -0.165 |
| -0.260000000000217 | -120 | -1.875 | -0.165 |
| -0.256000000000217 | -120 | -1.875 | -0.165 |
| -0.252000000000217 | -120 | -1.875 | -0.165 |
| -0.248000000000217 | -120 | -1.875 | -0.165 |
| -0.244000000000217 | -120 | -1.875 | -0.165 |
| -0.240000000000217 | -120 | -1.875 | -0.165 |
| -0.236000000000217 | -120 | -1.875 | -0.165 |
| -0.232000000000217 | -120 | -1.875 | -0.165 |
| -0.228000000000217 | -120 | -1.875 | -0.165 |
| -0.224000000000217 | -120 | -1.875 | -0.165 |
| -0.220000000000217 | -120 | -1.875 | -0.165 |
| -0.216000000000217 | -120 | -1.875 | -0.165 |
| -0.212000000000217 | -120 | -1.875 | -0.165 |
| -0.208000000000217 | -120 | -1.875 | -0.165 |
| -0.204000000000217 | -120 | -1.875 | -0.165 |
| -0.200000000000217 | -120 | -1.875 | -0.165 |
| -0.196000000000217 | -120 | -1.875 | -0.165 |
| -0.192000000000217 | -120 | -1.875 | -0.165 |
| -0.188000000000217 | -120 | -1.875 | -0.165 |
| -0.184000000000217 | -120 | -1.875 | -0.165 |
| -0.180000000000217 | -120 | -1.875 | -0.165 |
| -0.176000000000217 | -120 | -1.875 | -0.165 |
| -0.172000000000217 | -120 | -1.875 | -0.165 |
| -0.168000000000217 | -120 | -1.875 | -0.165 |
| -0.164000000000217 | -120 | -1.875 | -0.165 |
| -0.160000000000217 | -120 | -1.875 | -0.165 |
| -0.156000000000217 | -120 | -1.875 | -0.165 |
| -0.152000000000217 | -120 | -1.875 | -0.165 |
| -0.148000000000217 | -120 | -1.875 | -0.165 |
| -0.144000000000217 | -120 | -1.875 | -0.165 |
| -0.140000000000217 | -120 | -1.875 | -0.165 |
| -0.136000000000217 | -120 | -1.875 | -0.165 |
| -0.132000000000217 | -120 | -1.875 | -0.165 |
| -0.128000000000217 | -120 | -1.875 | -0.165 |
| -0.124000000000217 | -120 | -1.875 | -0.165 |
| -0.120000000000217 | -120 | -1.875 | -0.165 |
| -0.116000000000217 | -120 | -1.875 | -0.165 |
| -0.112000000000217 | -120 | -1.875 | -0.165 |
| -0.108000000000217 | -120 | -1.875 | -0.165 |
| -0.104000000000217 | -120 | -1.875 | -0.165 |
| -0.100000000000217 | -120 | -1.875 | -0.165 |
| -0.0960000000002168 | -120 | -1.875 | -0.165 |
| -0.0920000000002168 | -120 | -1.875 | -0.165 |
| -0.0880000000002168 | -120 | -1.875 | -0.165 |
| -0.0840000000002168 | -120 | -1.875 | -0.165 |
| -0.0800000000002168 | -120 | -1.875 | -0.165 |
| -0.0760000000002168 | -120 | -1.875 | -0.165 |
| -0.0720000000002168 | -120 | -1.875 | -0.165 |
| -0.0680000000002168 | -120 | -1.875 | -0.165 |
| -0.0640000000002168 | -120 | -1.875 | -0.165 |
| -0.0600000000002168 | -120 | -1.875 | -0.165 |
| -0.0560000000002168 | -120 | -1.875 | -0.165 |
| -0.0520000000002168 | -120 | -1.875 | -0.165 |
| -0.0480000000002167 | -120 | -1.875 | -0.165 |
| -0.0440000000002167 | -120 | -1.875 | -0.165 |
| -0.0400000000002167 | -120 | -1.875 | -0.165 |
| -0.0360000000002167 | -120 | -1.875 | -0.165 |
| -0.0320000000002167 | -120 | -1.875 | -0.165 |
| -0.0280000000002167 | -120 | -1.875 | -0.165 |
| -0.0240000000002167 | -120 | -1.875 | -0.165 |
| -0.0200000000002167 | -120 | -1.875 | -0.165 |
| -0.0160000000002167 | -120 | -1.875 | -0.165 |
| -0.0120000000002167 | -120 | -1.875 | -0.165 |
| -0.00800000000021674 | -12 | -1.875 | -0.165 |
| -0.00400000000021674 | -12 | -1.875 | -0.165 |
| -2.16743289982446e-13 | -120 | -1.875 | -0.165 |
| 0.00399999999978326 | -120 | -1.875 | -0.165 |
| 0.00799999999978325 | -12 | -1.875 | -0.165 |
| 0.0119999999997833 | -120 | -1.875 | -0.165 |
| 0.0159999999997833 | -120 | -1.875 | -0.165 |
| 0.0199999999997833 | -120 | -1.875 | -0.165 |
| 0.0239999999997833 | -120 | -1.875 | -0.165 |
| 0.0279999999997833 | -120 | -1.875 | -0.165 |
| 0.0319999999997833 | -120 | -1.875 | -0.165 |
| 0.0359999999997833 | -120 | -1.875 | -0.165 |
| 0.0399999999997833 | -120 | -1.875 | -0.165 |
| 0.0439999999997833 | -120 | -1.875 | -0.165 |
| 0.0479999999997833 | -120 | -1.875 | -0.165 |
| 0.0519999999997833 | -120 | -1.875 | -0.165 |
| 0.0559999999997833 | -120 | -1.875 | -0.165 |
| 0.0599999999997833 | -120 | -1.875 | -0.165 |
| 0.0639999999997833 | -120 | -1.875 | -0.165 |
| 0.0679999999997833 | -120 | -1.875 | -0.165 |
| 0.0719999999997833 | -120 | -1.875 | -0.165 |
| 0.0759999999997833 | -120 | -1.875 | -0.165 |
| 0.0799999999997833 | -120 | -1.875 | -0.165 |
| 0.0839999999997833 | -120 | -1.875 | -0.165 |
| 0.0879999999997833 | -120 | -1.875 | -0.165 |
| 0.0919999999997833 | -120 | -1.875 | -0.165 |
| 0.0959999999997833 | -120 | -1.875 | -0.165 |
| 0.0999999999997833 | -120 | -1.875 | -0.165 |
| 0.103999999999783 | -120 | -1.875 | -0.165 |
| 0.107999999999783 | -120 | -1.875 | -0.165 |
| 0.111999999999783 | -120 | -1.875 | -0.165 |
| 0.115999999999783 | -120 | -1.875 | -0.165 |
| 0.119999999999783 | -120 | -1.875 | -0.165 |
| 0.123999999999783 | -120 | -1.875 | -0.165 |
| 0.127999999999783 | -120 | -1.875 | -0.165 |
| 0.131999999999783 | -120 | -1.875 | -0.165 |
| 0.135999999999783 | -120 | -1.875 | -0.165 |
| 0.139999999999783 | -120 | -1.875 | -0.165 |
| 0.143999999999783 | -120 | -1.875 | -0.165 |
| 0.147999999999783 | -120 | -1.875 | -0.165 |
| 0.151999999999783 | -120 | -1.875 | -0.165 |
| 0.155999999999783 | -120 | -1.875 | -0.165 |
| 0.159999999999783 | -120 | -1.875 | -0.165 |
| 0.163999999999783 | -120 | -1.875 | -0.165 |
| 0.167999999999783 | -120 | -1.875 | -0.165 |
| 0.171999999999783 | -120 | -1.875 | -0.165 |
| 0.175999999999783 | -120 | -1.875 | -0.165 |
| 0.179999999999783 | -120 | -1.875 | -0.165 |
| 0.183999999999783 | -120 | -1.875 | -0.165 |
| 0.187999999999783 | -120 | -1.875 | -0.165 |
| 0.191999999999783 | -120 | -1.875 | -0.165 |
| 0.195999999999783 | -120 | -1.875 | -0.165 |
| 0.199999999999783 | -120 | -1.875 | -0.165 |
| 0.203999999999783 | -120 | -1.875 | -0.165 |
| 0.207999999999783 | -120 | -1.875 | -0.165 |
| 0.211999999999783 | -120 | -1.875 | -0.165 |
| 0.215999999999783 | -120 | -1.875 | -0.165 |
| 0.219999999999783 | -120 | -1.875 | -0.165 |
| 0.223999999999783 | -120 | -1.875 | -0.165 |
| 0.227999999999783 | -120 | -1.875 | -0.165 |
| 0.231999999999783 | -120 | -1.875 | -0.165 |
| 0.235999999999783 | -120 | -1.875 | -0.165 |
| 0.239999999999783 | -120 | -1.875 | -0.165 |
| 0.243999999999783 | -120 | -1.875 | -0.165 |
| 0.247999999999783 | -120 | -1.875 | -0.165 |
| 0.251999999999783 | -120 | -1.875 | -0.165 |
| 0.255999999999783 | -120 | -1.875 | -0.165 |
| 0.259999999999783 | -120 | -1.875 | -0.165 |
| 0.263999999999783 | -120 | -1.875 | -0.164 |
| 0.267999999999783 | -120 | -1.875 | -0.164 |
| 0.271999999999783 | -120 | -1.875 | -0.164 |
| 0.275999999999783 | -120 | -1.875 | -0.164 |
| 0.279999999999783 | -120 | -1.875 | -0.164 |
| 0.283999999999783 | -120 | -1.875 | -0.164 |
| 0.287999999999783 | -120 | -1.875 | -0.164 |
| 0.291999999999783 | -120 | -1.875 | -0.164 |
| 0.295999999999783 | -120 | -1.875 | -0.164 |
| 0.299999999999783 | -120 | -1.875 | -0.164 |
| 0.303999999999783 | -120 | -1.875 | -0.164 |
| 0.307999999999783 | -120 | -1.875 | -0.164 |
| 0.311999999999783 | -120 | -1.875 | -0.164 |
| 0.315999999999783 | -120 | -1.875 | -0.164 |
| 0.319999999999783 | -120 | -1.875 | -0.164 |
| 0.323999999999783 | -120 | -1.875 | -0.164 |
| 0.327999999999783 | -120 | -1.875 | -0.164 |
| 0.331999999999783 | -120 | -1.875 | -0.164 |
| 0.335999999999783 | -120 | -1.875 | -0.164 |
| 0.339999999999783 | -120 | -1.875 | -0.164 |
| 0.343999999999783 | -120 | -1.875 | -0.164 |
| 0.347999999999783 | -120 | -1.874 | -0.164 |
| 0.351999999999783 | -120 | -1.874 | -0.164 |
| 0.355999999999783 | -120 | -1.874 | -0.164 |
| 0.359999999999783 | -120 | -1.874 | -0.164 |
| 0.363999999999783 | -119.999 | -1.874 | -0.164 |
| 0.367999999999783 | -119.999 | -1.874 | -0.164 |
| 0.371999999999784 | -119.999 | -1.874 | -0.163 |
| 0.375999999999784 | -119.999 | -1.874 | -0.163 |
| 0.379999999999784 | -119.999 | -1.874 | -0.163 |
| 0.383999999999784 | -119.999 | -1.874 | -0.163 |
| 0.387999999999784 | -119.999 | -1.874 | -0.163 |
| 0.391999999999784 | -119.999 | -1.874 | -0.163 |
| 0.395999999999784 | -119.999 | -1.874 | -0.163 |
| 0.399999999999784 | -119.999 | -1.874 | -0.163 |
| 0.403999999999784 | -119.999 | -1.874 | -0.163 |
| 0.407999999999784 | -119.999 | -1.873 | -0.162 |
| 0.411999999999784 | -119.999 | -1.873 | -0.162 |
| 0.415999999999784 | -119.999 | -1.873 | -0.162 |
| 0.419999999999784 | -119.999 | -1.873 | -0.162 |
| 0.423999999999784 | -119.999 | -1.873 | -0.162 |
| 0.427999999999784 | -119.999 | -1.873 | -0.161 |
| 0.431999999999784 | -119.998 | -1.873 | -0.161 |
| 0.435999999999784 | -119.998 | -1.873 | -0.161 |
| 0.439999999999784 | -119.998 | -1.872 | -0.161 |
| 0.443999999999784 | -119.998 | -1.872 | -0.161 |
| 0.447999999999784 | -119.998 | -1.872 | -0.16 |
| 0.451999999999784 | -119.998 | -1.872 | -0.16 |
| 0.455999999999784 | -119.998 | -1.872 | -0.16 |
| 0.459999999999784 | -119.998 | -1.872 | -0.159 |
| 0.463999999999784 | -119.998 | -1.871 | -0.159 |
| 0.467999999999784 | -119.997 | -1.871 | -0.159 |
| 0.471999999999784 | -119.997 | -1.871 | -0.158 |
| 0.475999999999784 | -119.997 | -1.871 | -0.158 |
| 0.479999999999784 | -119.997 | -1.87 | -0.158 |
| 0.483999999999784 | -119.997 | -1.87 | -0.157 |
| 0.487999999999784 | -119.997 | -1.87 | -0.157 |
| 0.491999999999784 | -119.996 | -1.869 | -0.156 |
| 0.495999999999784 | -119.996 | -1.869 | -0.156 |
| 0.499999999999784 | -119.996 | -1.869 | -0.155 |
| 0.503999999999784 | -119.996 | -1.868 | -0.154 |
| 0.507999999999784 | -119.996 | -1.868 | -0.154 |
| 0.511999999999784 | -119.995 | -1.868 | -0.153 |
| 0.515999999999784 | -119.995 | -1.867 | -0.153 |
| 0.519999999999784 | -119.995 | -1.867 | -0.152 |
| 0.523999999999784 | -119.995 | -1.866 | -0.151 |
| 0.527999999999784 | -119.994 | -1.866 | -0.15 |
| 0.531999999999784 | -119.994 | -1.866 | -0.15 |
| 0.535999999999784 | -119.994 | -1.865 | -0.149 |
| 0.539999999999784 | -119.993 | -1.864 | -0.148 |
| 0.543999999999784 | -119.993 | -1.864 | -0.147 |
| 0.547999999999784 | -119.993 | -1.863 | -0.146 |
| 0.551999999999784 | -119.992 | -1.863 | -0.145 |
| 0.555999999999784 | -119.992 | -1.862 | -0.144 |
| 0.559999999999784 | -119.992 | -1.861 | -0.142 |
| 0.563999999999784 | -119.991 | -1.861 | -0.141 |
| 0.567999999999784 | -119.991 | -1.86 | -0.14 |
| 0.571999999999784 | -119.99 | -1.859 | -0.139 |
| 0.575999999999784 | -119.99 | -1.859 | -0.137 |
| 0.579999999999784 | -119.99 | -1.858 | -0.136 |
| 0.583999999999784 | -119.989 | -1.857 | -0.134 |
| 0.587999999999784 | -119.989 | -1.856 | -0.133 |
| 0.591999999999784 | -119.988 | -1.855 | -0.131 |
| 0.595999999999784 | -119.988 | -1.854 | -0.129 |
| 0.599999999999784 | -119.987 | -1.853 | -0.127 |
| 0.603999999999784 | -119.986 | -1.852 | -0.125 |
| 0.607999999999784 | -119.986 | -1.851 | -0.123 |
| 0.611999999999784 | -119.985 | -1.85 | -0.121 |
| 0.615999999999784 | -119.985 | -1.849 | -0.119 |
| 0.619999999999784 | -119.984 | -1.847 | -0.117 |
| 0.623999999999784 | -119.983 | -1.846 | -0.114 |
| 0.627999999999784 | -119.982 | -1.845 | -0.112 |
| 0.631999999999784 | -119.982 | -1.843 | -0.109 |
| 0.635999999999784 | -119.981 | -1.842 | -0.107 |
| 0.639999999999784 | -119.98 | -1.84 | -0.104 |
| 0.643999999999784 | -119.979 | -1.839 | -0.101 |
| 0.647999999999784 | -119.978 | -1.837 | -0.098 |
| 0.651999999999784 | -119.978 | -1.835 | -0.094 |
| 0.655999999999784 | -119.977 | -1.834 | -0.091 |
| 0.659999999999784 | -119.976 | -1.832 | -0.087 |
| 0.663999999999784 | -119.975 | -1.83 | -0.084 |
| 0.667999999999784 | -119.974 | -1.828 | -0.08 |
| 0.671999999999784 | -119.973 | -1.826 | -0.076 |
| 0.675999999999784 | -119.972 | -1.824 | -0.072 |
| 0.679999999999784 | -119.97 | -1.821 | -0.067 |
| 0.683999999999784 | -119.969 | -1.819 | -0.063 |
| 0.687999999999784 | -119.968 | -1.817 | -0.058 |
| 0.691999999999784 | -119.967 | -1.814 | -0.053 |
| 0.695999999999784 | -119.965 | -1.812 | -0.048 |
| 0.699999999999784 | -119.964 | -1.809 | -0.042 |
| 0.703999999999784 | -119.963 | -1.806 | -0.037 |
| 0.707999999999784 | -119.961 | -1.803 | -0.031 |
| 0.711999999999784 | -119.96 | -1.8 | -0.025 |
| 0.715999999999784 | -119.958 | -1.797 | -0.019 |
| 0.719999999999784 | -119.957 | -1.794 | -0.012 |
| 0.723999999999784 | -119.955 | -1.791 | -0.005 |
| 0.727999999999784 | -119.954 | -1.787 | 0.002 |
| 0.731999999999784 | -119.952 | -1.784 | 0.009 |
| 0.735999999999784 | -119.95 | -1.78 | 0.017 |
| 0.739999999999784 | -119.948 | -1.776 | 0.025 |
| 0.743999999999784 | -119.946 | -1.772 | 0.034 |
| 0.747999999999784 | -119.944 | -1.768 | 0.042 |
| 0.751999999999784 | -119.942 | -1.764 | 0.051 |
| 0.755999999999784 | -119.94 | -1.759 | 0.061 |
| 0.759999999999784 | -119.938 | -1.755 | 0.07 |
| 0.763999999999784 | -119.936 | -1.75 | 0.08 |
| 0.767999999999784 | -119.934 | -1.745 | 0.091 |
| 0.771999999999784 | -119.931 | -1.74 | 0.102 |
| 0.775999999999784 | -119.929 | -1.735 | 0.113 |
| 0.779999999999784 | -119.926 | -1.73 | 0.125 |
| 0.783999999999784 | -119.924 | -1.724 | 0.137 |
| 0.787999999999784 | -119.921 | -1.718 | 0.15 |
| 0.791999999999784 | -119.919 | -1.712 | 0.163 |
| 0.795999999999784 | -119.916 | -1.706 | 0.177 |
| 0.799999999999784 | -119.913 | -1.7 | 0.191 |
| 0.803999999999784 | -119.91 | -1.693 | 0.206 |
| 0.807999999999784 | -119.907 | -1.686 | 0.221 |
| 0.811999999999784 | -119.904 | -1.679 | 0.237 |
| 0.815999999999784 | -119.9 | -1.672 | 0.253 |
| 0.819999999999784 | -119.897 | -1.664 | 0.27 |
| 0.823999999999784 | -119.894 | -1.657 | 0.288 |
| 0.827999999999784 | -119.89 | -1.649 | 0.306 |
| 0.831999999999784 | -119.887 | -1.64 | 0.325 |
| 0.835999999999784 | -119.883 | -1.632 | 0.345 |
| 0.839999999999784 | -119.879 | -1.623 | 0.365 |
| 0.843999999999784 | -119.875 | -1.614 | 0.386 |
| 0.847999999999784 | -119.871 | -1.604 | 0.408 |
| 0.851999999999784 | -119.867 | -1.595 | 0.431 |
| 0.855999999999784 | -119.863 | -1.585 | 0.455 |
| 0.859999999999784 | -119.858 | -1.574 | 0.479 |
| 0.863999999999784 | -119.854 | -1.564 | 0.504 |
| 0.867999999999784 | -119.849 | -1.553 | 0.53 |
| 0.871999999999784 | -119.844 | -1.541 | 0.558 |
| 0.875999999999784 | -119.84 | -1.53 | 0.586 |
| 0.879999999999784 | -119.835 | -1.517 | 0.615 |
| 0.883999999999784 | -119.829 | -1.505 | 0.645 |
| 0.887999999999784 | -119.824 | -1.492 | 0.676 |
| 0.891999999999784 | -119.819 | -1.479 | 0.708 |
| 0.895999999999784 | -119.813 | -1.465 | 0.742 |
| 0.899999999999784 | -119.807 | -1.451 | 0.776 |
| 0.903999999999784 | -119.801 | -1.437 | 0.812 |
| 0.907999999999784 | -119.795 | -1.422 | 0.849 |
| 0.911999999999784 | -119.789 | -1.406 | 0.887 |
| 0.915999999999784 | -119.783 | -1.39 | 0.927 |
| 0.919999999999784 | -119.776 | -1.374 | 0.968 |
| 0.923999999999784 | -119.77 | -1.357 | 1.01 |
| 0.927999999999784 | -119.763 | -1.34 | 1.054 |
| 0.931999999999784 | -119.756 | -1.322 | 1.099 |
| 0.935999999999784 | -119.748 | -1.304 | 1.146 |
| 0.939999999999784 | -119.741 | -1.285 | 1.195 |
| 0.943999999999784 | -119.733 | -1.265 | 1.245 |
| 0.947999999999784 | -119.726 | -1.245 | 1.296 |
| 0.951999999999784 | -119.718 | -1.224 | 1.35 |
| 0.955999999999784 | -119.709 | -1.203 | 1.405 |
| 0.959999999999784 | -119.701 | -1.181 | 1.462 |
| 0.963999999999784 | -119.692 | -1.159 | 1.521 |
| 0.967999999999784 | -119.683 | -1.135 | 1.582 |
| 0.971999999999784 | -119.674 | -1.111 | 1.646 |
| 0.975999999999784 | -119.665 | -1.087 | 1.711 |
| 0.979999999999784 | -119.656 | -1.061 | 1.778 |
| 0.983999999999784 | -119.646 | -1.035 | 1.847 |
| 0.987999999999784 | -119.636 | -1.009 | 1.919 |
| 0.991999999999784 | -119.626 | -0.981 | 1.993 |
| 0.995999999999784 | -119.615 | -0.953 | 2.07 |
| 0.999999999999784 | -119.604 | -0.924 | 2.149 |
| 1.003999999999784 | -119.593 | -0.894 | 2.231 |
| 1.007999999999784 | -119.582 | -0.863 | 2.315 |
| 1.011999999999784 | -119.571 | -0.831 | 2.402 |
| 1.015999999999784 | -119.559 | -0.799 | 2.492 |
| 1.019999999999784 | -119.547 | -0.765 | 2.585 |
| 1.023999999999784 | -119.534 | -0.731 | 2.68 |
| 1.027999999999784 | -119.522 | -0.695 | 2.779 |
| 1.031999999999784 | -119.509 | -0.659 | 2.881 |
| 1.035999999999784 | -119.495 | -0.621 | 2.986 |
| 1.039999999999784 | -119.482 | -0.583 | 3.095 |
| 1.043999999999784 | -119.468 | -0.544 | 3.207 |
| 1.047999999999784 | -119.453 | -0.503 | 3.322 |
| 1.051999999999784 | -119.439 | -0.461 | 3.441 |
| 1.055999999999784 | -119.424 | -0.418 | 3.564 |
| 1.059999999999784 | -119.409 | -0.374 | 3.691 |
| 1.063999999999784 | -119.393 | -0.329 | 3.822 |
| 1.067999999999784 | -119.377 | -0.283 | 3.956 |
| 1.071999999999784 | -119.361 | -0.235 | 4.095 |
| 1.075999999999784 | -119.344 | -0.186 | 4.239 |
| 1.079999999999784 | -119.327 | -0.136 | 4.387 |
| 1.083999999999784 | -119.309 | -0.084 | 4.539 |
| 1.087999999999784 | -119.291 | -0.031 | 4.696 |
| 1.091999999999784 | -119.273 | 0.023 | 4.858 |
| 1.095999999999784 | -119.254 | 0.079 | 5.025 |
| 1.099999999999784 | -119.235 | 0.137 | 5.197 |
| 1.103999999999784 | -119.216 | 0.195 | 5.374 |
| 1.107999999999784 | -119.196 | 0.256 | 5.557 |
| 1.111999999999784 | -119.175 | 0.318 | 5.745 |
| 1.115999999999784 | -119.154 | 0.382 | 5.939 |
| 1.119999999999784 | -119.133 | 0.447 | 6.139 |
| 1.123999999999784 | -119.111 | 0.514 | 6.345 |
| 1.127999999999784 | -119.089 | 0.583 | 6.558 |
| 1.131999999999784 | -119.066 | 0.654 | 6.776 |
| 1.135999999999784 | -119.043 | 0.726 | 7.001 |
| 1.139999999999784 | -119.019 | 0.8 | 7.233 |
| 1.143999999999784 | -118.995 | 0.877 | 7.472 |
| 1.147999999999784 | -118.97 | 0.955 | 7.718 |
| 1.151999999999784 | -118.944 | 1.035 | 7.972 |
| 1.155999999999784 | -118.918 | 1.117 | 8.233 |
| 1.159999999999784 | -118.892 | 1.202 | 8.502 |
| 1.163999999999784 | -118.865 | 1.288 | 8.778 |
| 1.167999999999784 | -118.837 | 1.377 | 9.063 |
| 1.171999999999784 | -118.809 | 1.468 | 9.357 |
| 1.175999999999784 | -118.78 | 1.562 | 9.659 |
| 1.179999999999784 | -118.75 | 1.657 | 9.969 |
| 1.183999999999784 | -118.72 | 1.755 | 10.289 |
| 1.187999999999784 | -118.69 | 1.856 | 10.619 |
| 1.191999999999784 | -118.658 | 1.959 | 10.958 |
| 1.195999999999784 | -118.626 | 2.065 | 11.307 |
| 1.199999999999784 | -118.594 | 2.173 | 11.666 |
| 1.203999999999784 | -118.56 | 2.284 | 12.035 |
| 1.207999999999784 | -118.526 | 2.398 | 12.416 |
| 1.211999999999784 | -118.491 | 2.515 | 12.807 |
| 1.215999999999784 | -118.456 | 2.635 | 13.21 |
| 1.219999999999784 | -118.419 | 2.757 | 13.624 |
| 1.223999999999784 | -118.382 | 2.883 | 14.05 |
| 1.227999999999784 | -118.345 | 3.011 | 14.488 |
| 1.231999999999784 | -118.306 | 3.143 | 14.939 |
| 1.235999999999784 | -118.267 | 3.278 | 15.403 |
| 1.239999999999784 | -118.227 | 3.416 | 15.88 |
| 1.243999999999784 | -118.186 | 3.558 | 16.371 |
| 1.247999999999784 | -118.144 | 3.703 | 16.876 |
| 1.251999999999784 | -118.101 | 3.852 | 17.395 |
| 1.255999999999784 | -118.058 | 4.004 | 17.929 |
| 1.259999999999784 | -118.014 | 4.16 | 18.478 |
| 1.263999999999784 | -117.968 | 4.32 | 19.042 |
| 1.267999999999784 | -117.922 | 4.484 | 19.622 |
| 1.271999999999784 | -117.875 | 4.651 | 20.219 |
| 1.275999999999784 | -117.827 | 4.823 | 20.833 |
| 1.279999999999784 | -117.778 | 4.999 | 21.463 |
| 1.283999999999784 | -117.728 | 5.179 | 22.112 |
| 1.287999999999784 | -117.677 | 5.363 | 22.778 |
| 1.291999999999784 | -117.626 | 5.551 | 23.463 |
| 1.295999999999784 | -117.573 | 5.744 | 24.167 |
| 1.299999999999784 | -117.519 | 5.942 | 24.891 |
| 1.303999999999784 | -117.464 | 6.144 | 25.635 |
| 1.307999999999784 | -117.408 | 6.351 | 26.399 |
| 1.311999999999784 | -117.35 | 6.563 | 27.185 |
| 1.315999999999784 | -117.292 | 6.78 | 27.992 |
| 1.319999999999784 | -117.233 | 7.002 | 28.822 |
| 1.323999999999784 | -117.172 | 7.23 | 29.674 |
| 1.327999999999784 | -117.11 | 7.462 | 30.55 |
| 1.331999999999784 | -117.047 | 7.7 | 31.45 |
| 1.335999999999784 | -116.983 | 7.944 | 32.374 |
| 1.339999999999784 | -116.918 | 8.193 | 33.324 |
| 1.343999999999784 | -116.851 | 8.448 | 34.3 |
| 1.347999999999784 | -116.783 | 8.709 | 35.302 |
| 1.351999999999784 | -116.714 | 8.976 | 36.332 |
| 1.355999999999784 | -116.644 | 9.249 | 37.389 |
| 1.359999999999784 | -116.572 | 9.528 | 38.475 |
| 1.363999999999784 | -116.499 | 9.814 | 39.591 |
| 1.367999999999784 | -116.424 | 10.106 | 40.736 |
| 1.371999999999784 | -116.348 | 10.405 | 41.913 |
| 1.375999999999784 | -116.271 | 10.711 | 43.121 |
| 1.379999999999784 | -116.192 | 11.024 | 44.362 |
| 1.383999999999784 | -116.111 | 11.344 | 45.636 |
| 1.387999999999784 | -116.03 | 11.671 | 46.944 |
| 1.391999999999784 | -115.946 | 12.005 | 48.288 |
| 1.395999999999784 | -115.861 | 12.347 | 49.667 |
| 1.399999999999784 | -115.775 | 12.697 | 51.083 |
| 1.403999999999784 | -115.687 | 13.055 | 52.536 |
| 1.407999999999784 | -115.597 | 13.421 | 54.029 |
| 1.411999999999784 | -115.506 | 13.795 | 55.561 |
| 1.415999999999784 | -115.413 | 14.177 | 57.133 |
| 1.419999999999784 | -115.318 | 14.568 | 58.747 |
| 1.423999999999784 | -115.222 | 14.968 | 60.404 |
| 1.427999999999784 | -115.124 | 15.376 | 62.104 |
| 1.431999999999784 | -115.024 | 15.794 | 63.85 |
| 1.435999999999784 | -114.922 | 16.221 | 65.641 |
| 1.439999999999784 | -114.818 | 16.657 | 67.479 |
| 1.443999999999784 | -114.713 | 17.103 | 69.366 |
| 1.447999999999784 | -114.606 | 17.559 | 71.302 |
| 1.451999999999784 | -114.496 | 18.025 | 73.288 |
| 1.455999999999784 | -114.385 | 18.502 | 75.327 |
| 1.459999999999784 | -114.272 | 18.988 | 77.418 |
| 1.463999999999784 | -114.156 | 19.486 | 79.564 |
| 1.467999999999784 | -114.039 | 19.994 | 81.766 |
| 1.471999999999784 | -113.92 | 20.513 | 84.025 |
| 1.475999999999784 | -113.798 | 21.044 | 86.342 |
| 1.479999999999784 | -113.674 | 21.586 | 88.72 |
| 1.483999999999784 | -113.549 | 22.14 | 91.158 |
| 1.487999999999784 | -113.421 | 22.706 | 93.66 |
| 1.491999999999784 | -113.29 | 23.285 | 96.226 |
| 1.495999999999784 | -113.158 | 23.876 | 98.859 |
| 1.499999999999784 | -113.023 | 24.479 | 101.559 |
| 1.503999999999784 | -112.885 | 25.096 | 104.328 |
| 1.507999999999784 | -112.746 | 25.726 | 107.168 |
| 1.511999999999784 | -112.603 | 26.369 | 110.081 |
| 1.515999999999784 | -112.459 | 27.027 | 113.068 |
| 1.519999999999784 | -112.312 | 27.698 | 116.131 |
| 1.523999999999784 | -112.162 | 28.384 | 119.273 |
| 1.527999999999784 | -112.01 | 29.084 | 122.494 |
| 1.531999999999784 | -111.855 | 29.799 | 125.798 |
| 1.535999999999784 | -111.697 | 30.53 | 129.185 |
| 1.539999999999784 | -111.537 | 31.276 | 132.657 |
| 1.543999999999784 | -111.374 | 32.037 | 136.218 |
| 1.547999999999784 | -111.208 | 32.815 | 139.869 |
| 1.551999999999784 | -111.04 | 33.61 | 143.612 |
| 1.555999999999784 | -110.868 | 34.421 | 147.449 |
| 1.559999999999784 | -110.694 | 35.249 | 151.382 |
| 1.563999999999784 | -110.516 | 36.095 | 155.415 |
| 1.567999999999784 | -110.336 | 36.958 | 159.549 |
| 1.571999999999784 | -110.153 | 37.84 | 163.786 |
| 1.575999999999784 | -109.966 | 38.74 | 168.13 |
| 1.579999999999784 | -109.777 | 39.659 | 172.582 |
| 1.583999999999784 | -109.584 | 40.597 | 177.145 |
| 1.587999999999784 | -109.388 | 41.554 | 181.822 |
| 1.591999999999784 | -109.188 | 42.532 | 186.615 |
| 1.595999999999784 | -108.986 | 43.53 | 191.528 |
| 1.599999999999784 | -108.78 | 44.548 | 196.562 |
| 1.603999999999784 | -108.57 | 45.588 | 201.722 |
| 1.607999999999784 | -108.357 | 46.649 | 207.009 |
| 1.611999999999784 | -108.141 | 47.732 | 212.427 |
| 1.615999999999784 | -107.921 | 48.837 | 217.979 |
| 1.619999999999784 | -107.697 | 49.965 | 223.668 |
| 1.623999999999784 | -107.47 | 51.116 | 229.497 |
| 1.627999999999784 | -107.239 | 52.291 | 235.469 |
| 1.631999999999784 | -107.004 | 53.49 | 241.589 |
| 1.635999999999784 | -106.765 | 54.714 | 247.858 |
| 1.639999999999784 | -106.522 | 55.962 | 254.282 |
| 1.643999999999784 | -106.276 | 57.236 | 260.862 |
| 1.647999999999784 | -106.025 | 58.536 | 267.604 |
| 1.651999999999784 | -105.77 | 59.862 | 274.51 |
| 1.655999999999784 | -105.511 | 61.216 | 281.585 |
| 1.659999999999784 | -105.248 | 62.597 | 288.832 |
| 1.663999999999784 | -104.981 | 64.005 | 296.256 |
| 1.667999999999784 | -104.709 | 65.442 | 303.86 |
| 1.671999999999784 | -104.433 | 66.909 | 311.649 |
| 1.675999999999784 | -104.153 | 68.404 | 319.627 |
| 1.679999999999784 | -103.868 | 69.93 | 327.797 |
| 1.683999999999784 | -103.578 | 71.487 | 336.166 |
| 1.687999999999784 | -103.284 | 73.075 | 344.737 |
| 1.691999999999784 | -102.985 | 74.694 | 353.514 |
| 1.695999999999784 | -102.682 | 76.346 | 362.504 |
| 1.699999999999784 | -102.373 | 78.031 | 371.709 |
| 1.703999999999785 | -102.06 | 79.75 | 381.136 |
| 1.707999999999785 | -101.742 | 81.503 | 390.79 |
| 1.711999999999785 | -101.418 | 83.291 | 400.675 |
| 1.715999999999785 | -101.09 | 85.114 | 410.797 |
| 1.719999999999785 | -100.756 | 86.974 | 421.161 |
| 1.723999999999785 | -100.417 | 88.87 | 431.773 |
| 1.727999999999785 | -100.073 | 90.804 | 442.639 |
| 1.731999999999785 | -99.723 | 92.777 | 453.763 |
| 1.735999999999785 | -99.368 | 94.788 | 465.153 |
| 1.739999999999785 | -99.008 | 96.838 | 476.814 |
| 1.743999999999785 | -98.641 | 98.93 | 488.752 |
| 1.747999999999785 | -98.269 | 101.062 | 500.974 |
| 1.751999999999785 | -97.892 | 103.236 | 513.485 |
| 1.755999999999785 | -97.508 | 105.453 | 526.293 |
| 1.759999999999785 | -97.118 | 107.713 | 539.404 |
| 1.763999999999785 | -96.723 | 110.017 | 552.825 |
| 1.767999999999785 | -96.321 | 112.367 | 566.562 |
| 1.771999999999785 | -95.913 | 114.762 | 580.624 |
| 1.775999999999785 | -95.499 | 117.204 | 595.017 |
| 1.779999999999785 | -95.078 | 119.693 | 609.749 |
| 1.783999999999785 | -94.651 | 122.231 | 624.827 |
| 1.787999999999785 | -94.217 | 124.817 | 640.259 |
| 1.791999999999785 | -93.777 | 127.454 | 656.053 |
| 1.795999999999785 | -93.33 | 130.142 | 672.217 |
| 1.799999999999785 | -92.876 | 132.882 | 688.76 |
| 1.803999999999785 | -92.415 | 135.675 | 705.689 |
| 1.807999999999785 | -91.948 | 138.522 | 723.014 |
| 1.811999999999785 | -91.473 | 141.423 | 740.743 |
| 1.815999999999785 | -90.991 | 144.38 | 758.885 |
| 1.819999999999785 | -90.502 | 147.394 | 777.449 |
| 1.823999999999785 | -90.005 | 150.466 | 796.445 |
| 1.827999999999785 | -89.501 | 153.596 | 815.883 |
| 1.831999999999785 | -88.989 | 156.787 | 835.771 |
| 1.835999999999785 | -88.469 | 160.038 | 856.121 |
| 1.839999999999785 | -87.942 | 163.351 | 876.941 |
| 1.843999999999785 | -87.407 | 166.728 | 898.244 |
| 1.847999999999785 | -86.864 | 170.168 | 920.038 |
| 1.851999999999785 | -86.313 | 173.674 | 942.336 |
| 1.855999999999785 | -85.753 | 177.247 | 965.148 |
| 1.859999999999785 | -85.185 | 180.887 | 988.486 |
| 1.863999999999785 | -84.609 | 184.596 | 1012.36 |
| 1.867999999999785 | -84.024 | 188.376 | 1036.784 |
| 1.871999999999785 | -83.431 | 192.226 | 1061.768 |
| 1.875999999999785 | -82.828 | 196.15 | 1087.326 |
| 1.879999999999785 | -82.217 | 200.147 | 1113.469 |
| 1.883999999999785 | -81.597 | 204.219 | 1140.211 |
| 1.887999999999785 | -80.968 | 208.368 | 1167.565 |
| 1.891999999999785 | -80.329 | 212.595 | 1195.544 |
| 1.895999999999785 | -79.681 | 216.901 | 1224.161 |
| 1.899999999999785 | -79.024 | 221.287 | 1253.431 |
| 1.903999999999785 | -78.357 | 225.756 | 1283.368 |
| 1.907999999999785 | -77.68 | 230.308 | 1313.986 |
| 1.911999999999785 | -76.994 | 234.945 | 1345.3 |
| 1.915999999999785 | -76.297 | 239.669 | 1377.326 |
| 1.919999999999785 | -75.59 | 244.48 | 1410.078 |
| 1.923999999999785 | -74.873 | 249.381 | 1443.573 |
| 1.927999999999785 | -74.146 | 254.372 | 1477.826 |
| 1.931999999999785 | -73.408 | 259.457 | 1512.855 |
| 1.935999999999785 | -72.659 | 264.635 | 1548.675 |
| 1.939999999999785 | -71.9 | 269.909 | 1585.304 |
| 1.943999999999785 | -71.129 | 275.281 | 1622.759 |
| 1.947999999999785 | -70.348 | 280.752 | 1661.059 |
| 1.951999999999785 | -69.555 | 286.323 | 1700.221 |
| 1.955999999999785 | -68.751 | 291.998 | 1740.264 |
| 1.959999999999785 | -67.935 | 297.776 | 1781.207 |
| 1.963999999999785 | -67.108 | 303.661 | 1823.069 |
| 1.967999999999785 | -66.269 | 309.654 | 1865.87 |
| 1.971999999999785 | -65.418 | 315.757 | 1909.63 |
| 1.975999999999785 | -64.555 | 321.971 | 1954.37 |
| 1.979999999999785 | -63.679 | 328.299 | 2000.111 |
| 1.983999999999785 | -62.791 | 334.743 | 2046.874 |
| 1.987999999999785 | -61.891 | 341.304 | 2094.681 |
| 1.991999999999785 | -60.978 | 347.984 | 2143.554 |
| 1.995999999999785 | -60.052 | 354.787 | 2193.517 |
| 1.999999999999785 | -59.112 | 361.713 | 2244.591 |